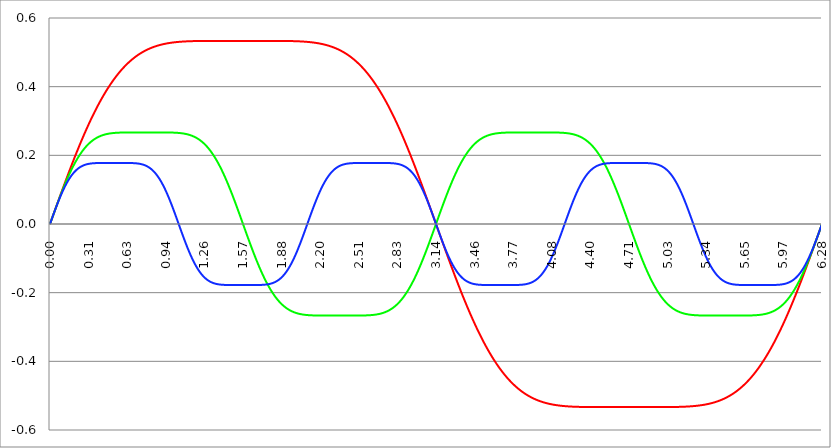
| Category | Series 1 | Series 0 | Series 2 |
|---|---|---|---|
| 0.0 | 0 | 0 | 0 |
| 0.00314159265358979 | 0.003 | 0.003 | 0.003 |
| 0.00628318530717958 | 0.006 | 0.006 | 0.006 |
| 0.00942477796076938 | 0.009 | 0.009 | 0.009 |
| 0.0125663706143592 | 0.013 | 0.013 | 0.013 |
| 0.015707963267949 | 0.016 | 0.016 | 0.016 |
| 0.0188495559215388 | 0.019 | 0.019 | 0.019 |
| 0.0219911485751285 | 0.022 | 0.022 | 0.022 |
| 0.0251327412287183 | 0.025 | 0.025 | 0.025 |
| 0.0282743338823081 | 0.028 | 0.028 | 0.028 |
| 0.0314159265358979 | 0.031 | 0.031 | 0.031 |
| 0.0345575191894877 | 0.035 | 0.034 | 0.034 |
| 0.0376991118430775 | 0.038 | 0.038 | 0.037 |
| 0.0408407044966673 | 0.041 | 0.041 | 0.04 |
| 0.0439822971502571 | 0.044 | 0.044 | 0.043 |
| 0.0471238898038469 | 0.047 | 0.047 | 0.046 |
| 0.0502654824574367 | 0.05 | 0.05 | 0.049 |
| 0.0534070751110265 | 0.053 | 0.053 | 0.052 |
| 0.0565486677646163 | 0.056 | 0.056 | 0.055 |
| 0.059690260418206 | 0.06 | 0.059 | 0.058 |
| 0.0628318530717958 | 0.063 | 0.062 | 0.061 |
| 0.0659734457253856 | 0.066 | 0.065 | 0.064 |
| 0.0691150383789754 | 0.069 | 0.068 | 0.067 |
| 0.0722566310325652 | 0.072 | 0.071 | 0.07 |
| 0.075398223686155 | 0.075 | 0.074 | 0.072 |
| 0.0785398163397448 | 0.078 | 0.077 | 0.075 |
| 0.0816814089933346 | 0.081 | 0.08 | 0.078 |
| 0.0848230016469244 | 0.084 | 0.083 | 0.08 |
| 0.0879645943005142 | 0.087 | 0.086 | 0.083 |
| 0.091106186954104 | 0.09 | 0.089 | 0.086 |
| 0.0942477796076937 | 0.094 | 0.092 | 0.088 |
| 0.0973893722612835 | 0.097 | 0.094 | 0.091 |
| 0.100530964914873 | 0.1 | 0.097 | 0.093 |
| 0.103672557568463 | 0.103 | 0.1 | 0.096 |
| 0.106814150222053 | 0.106 | 0.103 | 0.098 |
| 0.109955742875643 | 0.109 | 0.106 | 0.101 |
| 0.113097335529233 | 0.112 | 0.108 | 0.103 |
| 0.116238928182822 | 0.115 | 0.111 | 0.105 |
| 0.119380520836412 | 0.118 | 0.114 | 0.108 |
| 0.122522113490002 | 0.121 | 0.117 | 0.11 |
| 0.125663706143592 | 0.124 | 0.119 | 0.112 |
| 0.128805298797181 | 0.127 | 0.122 | 0.114 |
| 0.131946891450771 | 0.13 | 0.125 | 0.116 |
| 0.135088484104361 | 0.133 | 0.127 | 0.118 |
| 0.138230076757951 | 0.136 | 0.13 | 0.12 |
| 0.141371669411541 | 0.139 | 0.132 | 0.122 |
| 0.14451326206513 | 0.142 | 0.135 | 0.124 |
| 0.14765485471872 | 0.145 | 0.138 | 0.126 |
| 0.15079644737231 | 0.148 | 0.14 | 0.128 |
| 0.1539380400259 | 0.151 | 0.142 | 0.13 |
| 0.15707963267949 | 0.154 | 0.145 | 0.132 |
| 0.160221225333079 | 0.157 | 0.147 | 0.134 |
| 0.163362817986669 | 0.16 | 0.15 | 0.135 |
| 0.166504410640259 | 0.163 | 0.152 | 0.137 |
| 0.169646003293849 | 0.166 | 0.155 | 0.139 |
| 0.172787595947439 | 0.169 | 0.157 | 0.14 |
| 0.175929188601028 | 0.171 | 0.159 | 0.142 |
| 0.179070781254618 | 0.174 | 0.161 | 0.143 |
| 0.182212373908208 | 0.177 | 0.164 | 0.145 |
| 0.185353966561798 | 0.18 | 0.166 | 0.146 |
| 0.188495559215388 | 0.183 | 0.168 | 0.147 |
| 0.191637151868977 | 0.186 | 0.17 | 0.149 |
| 0.194778744522567 | 0.189 | 0.172 | 0.15 |
| 0.197920337176157 | 0.192 | 0.175 | 0.151 |
| 0.201061929829747 | 0.194 | 0.177 | 0.152 |
| 0.204203522483336 | 0.197 | 0.179 | 0.154 |
| 0.207345115136926 | 0.2 | 0.181 | 0.155 |
| 0.210486707790516 | 0.203 | 0.183 | 0.156 |
| 0.213628300444106 | 0.206 | 0.185 | 0.157 |
| 0.216769893097696 | 0.209 | 0.187 | 0.158 |
| 0.219911485751285 | 0.211 | 0.189 | 0.159 |
| 0.223053078404875 | 0.214 | 0.19 | 0.16 |
| 0.226194671058465 | 0.217 | 0.192 | 0.161 |
| 0.229336263712055 | 0.22 | 0.194 | 0.162 |
| 0.232477856365645 | 0.222 | 0.196 | 0.162 |
| 0.235619449019234 | 0.225 | 0.198 | 0.163 |
| 0.238761041672824 | 0.228 | 0.199 | 0.164 |
| 0.241902634326414 | 0.231 | 0.201 | 0.165 |
| 0.245044226980004 | 0.233 | 0.203 | 0.166 |
| 0.248185819633594 | 0.236 | 0.205 | 0.166 |
| 0.251327412287183 | 0.239 | 0.206 | 0.167 |
| 0.254469004940773 | 0.241 | 0.208 | 0.168 |
| 0.257610597594363 | 0.244 | 0.209 | 0.168 |
| 0.260752190247953 | 0.247 | 0.211 | 0.169 |
| 0.263893782901543 | 0.249 | 0.212 | 0.169 |
| 0.267035375555132 | 0.252 | 0.214 | 0.17 |
| 0.270176968208722 | 0.254 | 0.215 | 0.17 |
| 0.273318560862312 | 0.257 | 0.217 | 0.171 |
| 0.276460153515902 | 0.26 | 0.218 | 0.171 |
| 0.279601746169492 | 0.262 | 0.22 | 0.172 |
| 0.282743338823082 | 0.265 | 0.221 | 0.172 |
| 0.285884931476671 | 0.267 | 0.222 | 0.172 |
| 0.289026524130261 | 0.27 | 0.224 | 0.173 |
| 0.292168116783851 | 0.272 | 0.225 | 0.173 |
| 0.295309709437441 | 0.275 | 0.226 | 0.174 |
| 0.298451302091031 | 0.278 | 0.227 | 0.174 |
| 0.30159289474462 | 0.28 | 0.229 | 0.174 |
| 0.30473448739821 | 0.283 | 0.23 | 0.174 |
| 0.3078760800518 | 0.285 | 0.231 | 0.175 |
| 0.31101767270539 | 0.287 | 0.232 | 0.175 |
| 0.31415926535898 | 0.29 | 0.233 | 0.175 |
| 0.31730085801257 | 0.292 | 0.234 | 0.175 |
| 0.320442450666159 | 0.295 | 0.235 | 0.176 |
| 0.323584043319749 | 0.297 | 0.236 | 0.176 |
| 0.326725635973339 | 0.3 | 0.237 | 0.176 |
| 0.329867228626929 | 0.302 | 0.238 | 0.176 |
| 0.333008821280519 | 0.304 | 0.239 | 0.176 |
| 0.336150413934108 | 0.307 | 0.24 | 0.176 |
| 0.339292006587698 | 0.309 | 0.241 | 0.176 |
| 0.342433599241288 | 0.311 | 0.242 | 0.177 |
| 0.345575191894878 | 0.314 | 0.243 | 0.177 |
| 0.348716784548468 | 0.316 | 0.244 | 0.177 |
| 0.351858377202058 | 0.318 | 0.245 | 0.177 |
| 0.354999969855647 | 0.321 | 0.245 | 0.177 |
| 0.358141562509237 | 0.323 | 0.246 | 0.177 |
| 0.361283155162827 | 0.325 | 0.247 | 0.177 |
| 0.364424747816417 | 0.327 | 0.248 | 0.177 |
| 0.367566340470007 | 0.33 | 0.248 | 0.177 |
| 0.370707933123597 | 0.332 | 0.249 | 0.177 |
| 0.373849525777186 | 0.334 | 0.25 | 0.177 |
| 0.376991118430776 | 0.336 | 0.25 | 0.177 |
| 0.380132711084366 | 0.338 | 0.251 | 0.177 |
| 0.383274303737956 | 0.341 | 0.252 | 0.178 |
| 0.386415896391546 | 0.343 | 0.252 | 0.178 |
| 0.389557489045135 | 0.345 | 0.253 | 0.178 |
| 0.392699081698725 | 0.347 | 0.253 | 0.178 |
| 0.395840674352315 | 0.349 | 0.254 | 0.178 |
| 0.398982267005905 | 0.351 | 0.254 | 0.178 |
| 0.402123859659495 | 0.353 | 0.255 | 0.178 |
| 0.405265452313085 | 0.355 | 0.255 | 0.178 |
| 0.408407044966674 | 0.357 | 0.256 | 0.178 |
| 0.411548637620264 | 0.359 | 0.256 | 0.178 |
| 0.414690230273854 | 0.361 | 0.257 | 0.178 |
| 0.417831822927444 | 0.363 | 0.257 | 0.178 |
| 0.420973415581034 | 0.365 | 0.258 | 0.178 |
| 0.424115008234623 | 0.367 | 0.258 | 0.178 |
| 0.427256600888213 | 0.369 | 0.259 | 0.178 |
| 0.430398193541803 | 0.371 | 0.259 | 0.178 |
| 0.433539786195393 | 0.373 | 0.259 | 0.178 |
| 0.436681378848983 | 0.375 | 0.26 | 0.178 |
| 0.439822971502573 | 0.377 | 0.26 | 0.178 |
| 0.442964564156162 | 0.379 | 0.26 | 0.178 |
| 0.446106156809752 | 0.381 | 0.261 | 0.178 |
| 0.449247749463342 | 0.383 | 0.261 | 0.178 |
| 0.452389342116932 | 0.385 | 0.261 | 0.178 |
| 0.455530934770522 | 0.386 | 0.261 | 0.178 |
| 0.458672527424111 | 0.388 | 0.262 | 0.178 |
| 0.461814120077701 | 0.39 | 0.262 | 0.178 |
| 0.464955712731291 | 0.392 | 0.262 | 0.178 |
| 0.468097305384881 | 0.394 | 0.262 | 0.178 |
| 0.471238898038471 | 0.395 | 0.263 | 0.178 |
| 0.474380490692061 | 0.397 | 0.263 | 0.178 |
| 0.47752208334565 | 0.399 | 0.263 | 0.178 |
| 0.48066367599924 | 0.401 | 0.263 | 0.178 |
| 0.48380526865283 | 0.402 | 0.263 | 0.178 |
| 0.48694686130642 | 0.404 | 0.264 | 0.178 |
| 0.49008845396001 | 0.406 | 0.264 | 0.178 |
| 0.493230046613599 | 0.407 | 0.264 | 0.178 |
| 0.496371639267189 | 0.409 | 0.264 | 0.178 |
| 0.499513231920779 | 0.411 | 0.264 | 0.178 |
| 0.502654824574369 | 0.412 | 0.264 | 0.178 |
| 0.505796417227959 | 0.414 | 0.265 | 0.178 |
| 0.508938009881549 | 0.416 | 0.265 | 0.178 |
| 0.512079602535138 | 0.417 | 0.265 | 0.178 |
| 0.515221195188728 | 0.419 | 0.265 | 0.178 |
| 0.518362787842318 | 0.42 | 0.265 | 0.178 |
| 0.521504380495908 | 0.422 | 0.265 | 0.178 |
| 0.524645973149498 | 0.423 | 0.265 | 0.178 |
| 0.527787565803087 | 0.425 | 0.265 | 0.178 |
| 0.530929158456677 | 0.426 | 0.265 | 0.178 |
| 0.534070751110267 | 0.428 | 0.266 | 0.178 |
| 0.537212343763857 | 0.429 | 0.266 | 0.178 |
| 0.540353936417447 | 0.431 | 0.266 | 0.178 |
| 0.543495529071037 | 0.432 | 0.266 | 0.178 |
| 0.546637121724626 | 0.434 | 0.266 | 0.178 |
| 0.549778714378216 | 0.435 | 0.266 | 0.178 |
| 0.552920307031806 | 0.437 | 0.266 | 0.178 |
| 0.556061899685396 | 0.438 | 0.266 | 0.178 |
| 0.559203492338986 | 0.439 | 0.266 | 0.178 |
| 0.562345084992576 | 0.441 | 0.266 | 0.178 |
| 0.565486677646165 | 0.442 | 0.266 | 0.178 |
| 0.568628270299755 | 0.443 | 0.266 | 0.178 |
| 0.571769862953345 | 0.445 | 0.266 | 0.178 |
| 0.574911455606935 | 0.446 | 0.266 | 0.178 |
| 0.578053048260525 | 0.447 | 0.266 | 0.178 |
| 0.581194640914114 | 0.449 | 0.266 | 0.178 |
| 0.584336233567704 | 0.45 | 0.266 | 0.178 |
| 0.587477826221294 | 0.451 | 0.266 | 0.178 |
| 0.590619418874884 | 0.452 | 0.266 | 0.178 |
| 0.593761011528474 | 0.454 | 0.266 | 0.178 |
| 0.596902604182064 | 0.455 | 0.266 | 0.178 |
| 0.600044196835653 | 0.456 | 0.266 | 0.178 |
| 0.603185789489243 | 0.457 | 0.266 | 0.178 |
| 0.606327382142833 | 0.459 | 0.267 | 0.178 |
| 0.609468974796423 | 0.46 | 0.267 | 0.178 |
| 0.612610567450013 | 0.461 | 0.267 | 0.178 |
| 0.615752160103602 | 0.462 | 0.267 | 0.178 |
| 0.618893752757192 | 0.463 | 0.267 | 0.178 |
| 0.622035345410782 | 0.464 | 0.267 | 0.178 |
| 0.625176938064372 | 0.465 | 0.267 | 0.178 |
| 0.628318530717962 | 0.466 | 0.267 | 0.178 |
| 0.631460123371551 | 0.468 | 0.267 | 0.178 |
| 0.634601716025141 | 0.469 | 0.267 | 0.178 |
| 0.637743308678731 | 0.47 | 0.267 | 0.178 |
| 0.640884901332321 | 0.471 | 0.267 | 0.178 |
| 0.644026493985911 | 0.472 | 0.267 | 0.178 |
| 0.647168086639501 | 0.473 | 0.267 | 0.178 |
| 0.65030967929309 | 0.474 | 0.267 | 0.178 |
| 0.65345127194668 | 0.475 | 0.267 | 0.178 |
| 0.65659286460027 | 0.476 | 0.267 | 0.178 |
| 0.65973445725386 | 0.477 | 0.267 | 0.178 |
| 0.66287604990745 | 0.478 | 0.267 | 0.178 |
| 0.666017642561039 | 0.479 | 0.267 | 0.177 |
| 0.669159235214629 | 0.48 | 0.267 | 0.177 |
| 0.672300827868219 | 0.48 | 0.267 | 0.177 |
| 0.675442420521809 | 0.481 | 0.267 | 0.177 |
| 0.678584013175399 | 0.482 | 0.267 | 0.177 |
| 0.681725605828989 | 0.483 | 0.267 | 0.177 |
| 0.684867198482578 | 0.484 | 0.267 | 0.177 |
| 0.688008791136168 | 0.485 | 0.267 | 0.177 |
| 0.691150383789758 | 0.486 | 0.267 | 0.177 |
| 0.694291976443348 | 0.487 | 0.267 | 0.177 |
| 0.697433569096938 | 0.487 | 0.267 | 0.177 |
| 0.700575161750528 | 0.488 | 0.267 | 0.177 |
| 0.703716754404117 | 0.489 | 0.267 | 0.177 |
| 0.706858347057707 | 0.49 | 0.267 | 0.177 |
| 0.709999939711297 | 0.491 | 0.267 | 0.176 |
| 0.713141532364887 | 0.492 | 0.267 | 0.176 |
| 0.716283125018477 | 0.492 | 0.267 | 0.176 |
| 0.719424717672066 | 0.493 | 0.267 | 0.176 |
| 0.722566310325656 | 0.494 | 0.267 | 0.176 |
| 0.725707902979246 | 0.495 | 0.267 | 0.176 |
| 0.728849495632836 | 0.495 | 0.267 | 0.175 |
| 0.731991088286426 | 0.496 | 0.267 | 0.175 |
| 0.735132680940016 | 0.497 | 0.267 | 0.175 |
| 0.738274273593605 | 0.497 | 0.267 | 0.175 |
| 0.741415866247195 | 0.498 | 0.267 | 0.174 |
| 0.744557458900785 | 0.499 | 0.267 | 0.174 |
| 0.747699051554375 | 0.499 | 0.267 | 0.174 |
| 0.750840644207965 | 0.5 | 0.267 | 0.174 |
| 0.753982236861554 | 0.501 | 0.267 | 0.173 |
| 0.757123829515144 | 0.501 | 0.267 | 0.173 |
| 0.760265422168734 | 0.502 | 0.267 | 0.173 |
| 0.763407014822324 | 0.503 | 0.267 | 0.172 |
| 0.766548607475914 | 0.503 | 0.267 | 0.172 |
| 0.769690200129504 | 0.504 | 0.267 | 0.171 |
| 0.772831792783093 | 0.504 | 0.267 | 0.171 |
| 0.775973385436683 | 0.505 | 0.267 | 0.17 |
| 0.779114978090273 | 0.506 | 0.267 | 0.17 |
| 0.782256570743863 | 0.506 | 0.267 | 0.169 |
| 0.785398163397453 | 0.507 | 0.267 | 0.169 |
| 0.788539756051042 | 0.507 | 0.267 | 0.168 |
| 0.791681348704632 | 0.508 | 0.267 | 0.168 |
| 0.794822941358222 | 0.508 | 0.267 | 0.167 |
| 0.797964534011812 | 0.509 | 0.267 | 0.166 |
| 0.801106126665402 | 0.509 | 0.267 | 0.166 |
| 0.804247719318992 | 0.51 | 0.267 | 0.165 |
| 0.807389311972581 | 0.51 | 0.267 | 0.164 |
| 0.810530904626171 | 0.511 | 0.267 | 0.164 |
| 0.813672497279761 | 0.511 | 0.267 | 0.163 |
| 0.816814089933351 | 0.512 | 0.267 | 0.162 |
| 0.819955682586941 | 0.512 | 0.267 | 0.161 |
| 0.823097275240531 | 0.513 | 0.267 | 0.16 |
| 0.82623886789412 | 0.513 | 0.267 | 0.159 |
| 0.82938046054771 | 0.514 | 0.267 | 0.158 |
| 0.8325220532013 | 0.514 | 0.267 | 0.157 |
| 0.83566364585489 | 0.515 | 0.267 | 0.156 |
| 0.83880523850848 | 0.515 | 0.267 | 0.155 |
| 0.841946831162069 | 0.515 | 0.267 | 0.154 |
| 0.845088423815659 | 0.516 | 0.267 | 0.153 |
| 0.848230016469249 | 0.516 | 0.267 | 0.152 |
| 0.851371609122839 | 0.517 | 0.267 | 0.15 |
| 0.854513201776429 | 0.517 | 0.267 | 0.149 |
| 0.857654794430019 | 0.517 | 0.267 | 0.148 |
| 0.860796387083608 | 0.518 | 0.267 | 0.146 |
| 0.863937979737198 | 0.518 | 0.267 | 0.145 |
| 0.867079572390788 | 0.518 | 0.267 | 0.144 |
| 0.870221165044378 | 0.519 | 0.267 | 0.142 |
| 0.873362757697968 | 0.519 | 0.267 | 0.141 |
| 0.876504350351557 | 0.52 | 0.267 | 0.139 |
| 0.879645943005147 | 0.52 | 0.267 | 0.137 |
| 0.882787535658737 | 0.52 | 0.267 | 0.136 |
| 0.885929128312327 | 0.521 | 0.267 | 0.134 |
| 0.889070720965917 | 0.521 | 0.267 | 0.132 |
| 0.892212313619507 | 0.521 | 0.267 | 0.131 |
| 0.895353906273096 | 0.521 | 0.267 | 0.129 |
| 0.898495498926686 | 0.522 | 0.267 | 0.127 |
| 0.901637091580276 | 0.522 | 0.267 | 0.125 |
| 0.904778684233866 | 0.522 | 0.267 | 0.123 |
| 0.907920276887456 | 0.523 | 0.267 | 0.121 |
| 0.911061869541045 | 0.523 | 0.267 | 0.119 |
| 0.914203462194635 | 0.523 | 0.267 | 0.117 |
| 0.917345054848225 | 0.523 | 0.267 | 0.115 |
| 0.920486647501815 | 0.524 | 0.267 | 0.113 |
| 0.923628240155405 | 0.524 | 0.267 | 0.111 |
| 0.926769832808995 | 0.524 | 0.267 | 0.108 |
| 0.929911425462584 | 0.524 | 0.267 | 0.106 |
| 0.933053018116174 | 0.525 | 0.267 | 0.104 |
| 0.936194610769764 | 0.525 | 0.267 | 0.101 |
| 0.939336203423354 | 0.525 | 0.267 | 0.099 |
| 0.942477796076944 | 0.525 | 0.267 | 0.097 |
| 0.945619388730533 | 0.526 | 0.267 | 0.094 |
| 0.948760981384123 | 0.526 | 0.267 | 0.092 |
| 0.951902574037713 | 0.526 | 0.267 | 0.089 |
| 0.955044166691303 | 0.526 | 0.267 | 0.087 |
| 0.958185759344893 | 0.526 | 0.267 | 0.084 |
| 0.961327351998483 | 0.527 | 0.267 | 0.081 |
| 0.964468944652072 | 0.527 | 0.267 | 0.079 |
| 0.967610537305662 | 0.527 | 0.266 | 0.076 |
| 0.970752129959252 | 0.527 | 0.266 | 0.073 |
| 0.973893722612842 | 0.527 | 0.266 | 0.07 |
| 0.977035315266432 | 0.527 | 0.266 | 0.068 |
| 0.980176907920022 | 0.528 | 0.266 | 0.065 |
| 0.983318500573611 | 0.528 | 0.266 | 0.062 |
| 0.986460093227201 | 0.528 | 0.266 | 0.059 |
| 0.989601685880791 | 0.528 | 0.266 | 0.056 |
| 0.992743278534381 | 0.528 | 0.266 | 0.053 |
| 0.995884871187971 | 0.528 | 0.266 | 0.05 |
| 0.99902646384156 | 0.529 | 0.266 | 0.047 |
| 1.00216805649515 | 0.529 | 0.266 | 0.044 |
| 1.00530964914874 | 0.529 | 0.266 | 0.041 |
| 1.00845124180233 | 0.529 | 0.266 | 0.038 |
| 1.01159283445592 | 0.529 | 0.266 | 0.035 |
| 1.01473442710951 | 0.529 | 0.266 | 0.032 |
| 1.017876019763099 | 0.529 | 0.266 | 0.029 |
| 1.021017612416689 | 0.53 | 0.266 | 0.026 |
| 1.02415920507028 | 0.53 | 0.266 | 0.023 |
| 1.027300797723869 | 0.53 | 0.266 | 0.02 |
| 1.030442390377459 | 0.53 | 0.266 | 0.017 |
| 1.033583983031048 | 0.53 | 0.266 | 0.014 |
| 1.036725575684638 | 0.53 | 0.266 | 0.01 |
| 1.039867168338228 | 0.53 | 0.265 | 0.007 |
| 1.043008760991818 | 0.53 | 0.265 | 0.004 |
| 1.046150353645408 | 0.53 | 0.265 | 0.001 |
| 1.049291946298998 | 0.531 | 0.265 | -0.002 |
| 1.052433538952587 | 0.531 | 0.265 | -0.005 |
| 1.055575131606177 | 0.531 | 0.265 | -0.008 |
| 1.058716724259767 | 0.531 | 0.265 | -0.012 |
| 1.061858316913357 | 0.531 | 0.265 | -0.015 |
| 1.064999909566947 | 0.531 | 0.265 | -0.018 |
| 1.068141502220536 | 0.531 | 0.264 | -0.021 |
| 1.071283094874126 | 0.531 | 0.264 | -0.024 |
| 1.074424687527716 | 0.531 | 0.264 | -0.027 |
| 1.077566280181306 | 0.531 | 0.264 | -0.03 |
| 1.080707872834896 | 0.531 | 0.264 | -0.033 |
| 1.083849465488486 | 0.531 | 0.264 | -0.036 |
| 1.086991058142075 | 0.531 | 0.263 | -0.039 |
| 1.090132650795665 | 0.532 | 0.263 | -0.042 |
| 1.093274243449255 | 0.532 | 0.263 | -0.045 |
| 1.096415836102845 | 0.532 | 0.263 | -0.048 |
| 1.099557428756435 | 0.532 | 0.263 | -0.051 |
| 1.102699021410025 | 0.532 | 0.262 | -0.054 |
| 1.105840614063614 | 0.532 | 0.262 | -0.057 |
| 1.108982206717204 | 0.532 | 0.262 | -0.06 |
| 1.112123799370794 | 0.532 | 0.262 | -0.063 |
| 1.115265392024384 | 0.532 | 0.261 | -0.066 |
| 1.118406984677974 | 0.532 | 0.261 | -0.069 |
| 1.121548577331563 | 0.532 | 0.261 | -0.071 |
| 1.124690169985153 | 0.532 | 0.261 | -0.074 |
| 1.127831762638743 | 0.532 | 0.26 | -0.077 |
| 1.130973355292333 | 0.532 | 0.26 | -0.08 |
| 1.134114947945923 | 0.532 | 0.26 | -0.082 |
| 1.137256540599513 | 0.532 | 0.259 | -0.085 |
| 1.140398133253102 | 0.532 | 0.259 | -0.087 |
| 1.143539725906692 | 0.532 | 0.259 | -0.09 |
| 1.146681318560282 | 0.532 | 0.258 | -0.093 |
| 1.149822911213872 | 0.533 | 0.258 | -0.095 |
| 1.152964503867462 | 0.533 | 0.257 | -0.097 |
| 1.156106096521051 | 0.533 | 0.257 | -0.1 |
| 1.159247689174641 | 0.533 | 0.256 | -0.102 |
| 1.162389281828231 | 0.533 | 0.256 | -0.105 |
| 1.165530874481821 | 0.533 | 0.255 | -0.107 |
| 1.168672467135411 | 0.533 | 0.255 | -0.109 |
| 1.171814059789001 | 0.533 | 0.254 | -0.111 |
| 1.17495565244259 | 0.533 | 0.254 | -0.114 |
| 1.17809724509618 | 0.533 | 0.253 | -0.116 |
| 1.18123883774977 | 0.533 | 0.253 | -0.118 |
| 1.18438043040336 | 0.533 | 0.252 | -0.12 |
| 1.18752202305695 | 0.533 | 0.252 | -0.122 |
| 1.190663615710539 | 0.533 | 0.251 | -0.124 |
| 1.193805208364129 | 0.533 | 0.25 | -0.126 |
| 1.19694680101772 | 0.533 | 0.25 | -0.128 |
| 1.200088393671309 | 0.533 | 0.249 | -0.129 |
| 1.203229986324899 | 0.533 | 0.248 | -0.131 |
| 1.206371578978489 | 0.533 | 0.248 | -0.133 |
| 1.209513171632078 | 0.533 | 0.247 | -0.135 |
| 1.212654764285668 | 0.533 | 0.246 | -0.136 |
| 1.215796356939258 | 0.533 | 0.245 | -0.138 |
| 1.218937949592848 | 0.533 | 0.245 | -0.14 |
| 1.222079542246438 | 0.533 | 0.244 | -0.141 |
| 1.225221134900027 | 0.533 | 0.243 | -0.143 |
| 1.228362727553617 | 0.533 | 0.242 | -0.144 |
| 1.231504320207207 | 0.533 | 0.241 | -0.146 |
| 1.234645912860797 | 0.533 | 0.24 | -0.147 |
| 1.237787505514387 | 0.533 | 0.239 | -0.148 |
| 1.240929098167977 | 0.533 | 0.238 | -0.15 |
| 1.244070690821566 | 0.533 | 0.237 | -0.151 |
| 1.247212283475156 | 0.533 | 0.236 | -0.152 |
| 1.250353876128746 | 0.533 | 0.235 | -0.153 |
| 1.253495468782336 | 0.533 | 0.234 | -0.154 |
| 1.256637061435926 | 0.533 | 0.233 | -0.155 |
| 1.259778654089515 | 0.533 | 0.232 | -0.157 |
| 1.262920246743105 | 0.533 | 0.231 | -0.158 |
| 1.266061839396695 | 0.533 | 0.23 | -0.159 |
| 1.269203432050285 | 0.533 | 0.229 | -0.16 |
| 1.272345024703875 | 0.533 | 0.227 | -0.16 |
| 1.275486617357465 | 0.533 | 0.226 | -0.161 |
| 1.278628210011054 | 0.533 | 0.225 | -0.162 |
| 1.281769802664644 | 0.533 | 0.224 | -0.163 |
| 1.284911395318234 | 0.533 | 0.222 | -0.164 |
| 1.288052987971824 | 0.533 | 0.221 | -0.165 |
| 1.291194580625414 | 0.533 | 0.22 | -0.165 |
| 1.294336173279003 | 0.533 | 0.218 | -0.166 |
| 1.297477765932593 | 0.533 | 0.217 | -0.167 |
| 1.300619358586183 | 0.533 | 0.215 | -0.167 |
| 1.303760951239773 | 0.533 | 0.214 | -0.168 |
| 1.306902543893363 | 0.533 | 0.212 | -0.169 |
| 1.310044136546953 | 0.533 | 0.211 | -0.169 |
| 1.313185729200542 | 0.533 | 0.209 | -0.17 |
| 1.316327321854132 | 0.533 | 0.208 | -0.17 |
| 1.319468914507722 | 0.533 | 0.206 | -0.171 |
| 1.322610507161312 | 0.533 | 0.205 | -0.171 |
| 1.325752099814902 | 0.533 | 0.203 | -0.172 |
| 1.328893692468491 | 0.533 | 0.201 | -0.172 |
| 1.332035285122081 | 0.533 | 0.199 | -0.172 |
| 1.335176877775671 | 0.533 | 0.198 | -0.173 |
| 1.338318470429261 | 0.533 | 0.196 | -0.173 |
| 1.341460063082851 | 0.533 | 0.194 | -0.173 |
| 1.344601655736441 | 0.533 | 0.192 | -0.174 |
| 1.34774324839003 | 0.533 | 0.19 | -0.174 |
| 1.35088484104362 | 0.533 | 0.189 | -0.174 |
| 1.35402643369721 | 0.533 | 0.187 | -0.175 |
| 1.3571680263508 | 0.533 | 0.185 | -0.175 |
| 1.36030961900439 | 0.533 | 0.183 | -0.175 |
| 1.363451211657979 | 0.533 | 0.181 | -0.175 |
| 1.36659280431157 | 0.533 | 0.179 | -0.175 |
| 1.369734396965159 | 0.533 | 0.177 | -0.176 |
| 1.372875989618749 | 0.533 | 0.175 | -0.176 |
| 1.376017582272339 | 0.533 | 0.172 | -0.176 |
| 1.379159174925929 | 0.533 | 0.17 | -0.176 |
| 1.382300767579518 | 0.533 | 0.168 | -0.176 |
| 1.385442360233108 | 0.533 | 0.166 | -0.176 |
| 1.388583952886698 | 0.533 | 0.164 | -0.177 |
| 1.391725545540288 | 0.533 | 0.161 | -0.177 |
| 1.394867138193878 | 0.533 | 0.159 | -0.177 |
| 1.398008730847468 | 0.533 | 0.157 | -0.177 |
| 1.401150323501057 | 0.533 | 0.155 | -0.177 |
| 1.404291916154647 | 0.533 | 0.152 | -0.177 |
| 1.407433508808237 | 0.533 | 0.15 | -0.177 |
| 1.410575101461827 | 0.533 | 0.147 | -0.177 |
| 1.413716694115417 | 0.533 | 0.145 | -0.177 |
| 1.416858286769006 | 0.533 | 0.142 | -0.177 |
| 1.419999879422596 | 0.533 | 0.14 | -0.177 |
| 1.423141472076186 | 0.533 | 0.138 | -0.177 |
| 1.426283064729776 | 0.533 | 0.135 | -0.177 |
| 1.429424657383366 | 0.533 | 0.132 | -0.177 |
| 1.432566250036956 | 0.533 | 0.13 | -0.178 |
| 1.435707842690545 | 0.533 | 0.127 | -0.178 |
| 1.438849435344135 | 0.533 | 0.125 | -0.178 |
| 1.441991027997725 | 0.533 | 0.122 | -0.178 |
| 1.445132620651315 | 0.533 | 0.119 | -0.178 |
| 1.448274213304905 | 0.533 | 0.117 | -0.178 |
| 1.451415805958494 | 0.533 | 0.114 | -0.178 |
| 1.454557398612084 | 0.533 | 0.111 | -0.178 |
| 1.457698991265674 | 0.533 | 0.108 | -0.178 |
| 1.460840583919264 | 0.533 | 0.106 | -0.178 |
| 1.463982176572854 | 0.533 | 0.103 | -0.178 |
| 1.467123769226444 | 0.533 | 0.1 | -0.178 |
| 1.470265361880033 | 0.533 | 0.097 | -0.178 |
| 1.473406954533623 | 0.533 | 0.094 | -0.178 |
| 1.476548547187213 | 0.533 | 0.092 | -0.178 |
| 1.479690139840803 | 0.533 | 0.089 | -0.178 |
| 1.482831732494393 | 0.533 | 0.086 | -0.178 |
| 1.485973325147982 | 0.533 | 0.083 | -0.178 |
| 1.489114917801572 | 0.533 | 0.08 | -0.178 |
| 1.492256510455162 | 0.533 | 0.077 | -0.178 |
| 1.495398103108752 | 0.533 | 0.074 | -0.178 |
| 1.498539695762342 | 0.533 | 0.071 | -0.178 |
| 1.501681288415932 | 0.533 | 0.068 | -0.178 |
| 1.504822881069521 | 0.533 | 0.065 | -0.178 |
| 1.507964473723111 | 0.533 | 0.062 | -0.178 |
| 1.511106066376701 | 0.533 | 0.059 | -0.178 |
| 1.514247659030291 | 0.533 | 0.056 | -0.178 |
| 1.517389251683881 | 0.533 | 0.053 | -0.178 |
| 1.520530844337471 | 0.533 | 0.05 | -0.178 |
| 1.52367243699106 | 0.533 | 0.047 | -0.178 |
| 1.52681402964465 | 0.533 | 0.044 | -0.178 |
| 1.52995562229824 | 0.533 | 0.041 | -0.178 |
| 1.53309721495183 | 0.533 | 0.038 | -0.178 |
| 1.53623880760542 | 0.533 | 0.034 | -0.178 |
| 1.539380400259009 | 0.533 | 0.031 | -0.178 |
| 1.542521992912599 | 0.533 | 0.028 | -0.178 |
| 1.545663585566189 | 0.533 | 0.025 | -0.178 |
| 1.548805178219779 | 0.533 | 0.022 | -0.178 |
| 1.551946770873369 | 0.533 | 0.019 | -0.178 |
| 1.555088363526959 | 0.533 | 0.016 | -0.178 |
| 1.558229956180548 | 0.533 | 0.013 | -0.178 |
| 1.561371548834138 | 0.533 | 0.009 | -0.178 |
| 1.564513141487728 | 0.533 | 0.006 | -0.178 |
| 1.567654734141318 | 0.533 | 0.003 | -0.178 |
| 1.570796326794908 | 0.533 | 0 | -0.178 |
| 1.573937919448497 | 0.533 | -0.003 | -0.178 |
| 1.577079512102087 | 0.533 | -0.006 | -0.178 |
| 1.580221104755677 | 0.533 | -0.009 | -0.178 |
| 1.583362697409267 | 0.533 | -0.013 | -0.178 |
| 1.586504290062857 | 0.533 | -0.016 | -0.178 |
| 1.589645882716447 | 0.533 | -0.019 | -0.178 |
| 1.592787475370036 | 0.533 | -0.022 | -0.178 |
| 1.595929068023626 | 0.533 | -0.025 | -0.178 |
| 1.599070660677216 | 0.533 | -0.028 | -0.178 |
| 1.602212253330806 | 0.533 | -0.031 | -0.178 |
| 1.605353845984396 | 0.533 | -0.034 | -0.178 |
| 1.608495438637985 | 0.533 | -0.038 | -0.178 |
| 1.611637031291575 | 0.533 | -0.041 | -0.178 |
| 1.614778623945165 | 0.533 | -0.044 | -0.178 |
| 1.617920216598755 | 0.533 | -0.047 | -0.178 |
| 1.621061809252345 | 0.533 | -0.05 | -0.178 |
| 1.624203401905935 | 0.533 | -0.053 | -0.178 |
| 1.627344994559524 | 0.533 | -0.056 | -0.178 |
| 1.630486587213114 | 0.533 | -0.059 | -0.178 |
| 1.633628179866704 | 0.533 | -0.062 | -0.178 |
| 1.636769772520294 | 0.533 | -0.065 | -0.178 |
| 1.639911365173884 | 0.533 | -0.068 | -0.178 |
| 1.643052957827473 | 0.533 | -0.071 | -0.178 |
| 1.646194550481063 | 0.533 | -0.074 | -0.178 |
| 1.649336143134653 | 0.533 | -0.077 | -0.178 |
| 1.652477735788243 | 0.533 | -0.08 | -0.178 |
| 1.655619328441833 | 0.533 | -0.083 | -0.178 |
| 1.658760921095423 | 0.533 | -0.086 | -0.178 |
| 1.661902513749012 | 0.533 | -0.089 | -0.178 |
| 1.665044106402602 | 0.533 | -0.092 | -0.178 |
| 1.668185699056192 | 0.533 | -0.094 | -0.178 |
| 1.671327291709782 | 0.533 | -0.097 | -0.178 |
| 1.674468884363372 | 0.533 | -0.1 | -0.178 |
| 1.677610477016961 | 0.533 | -0.103 | -0.178 |
| 1.680752069670551 | 0.533 | -0.106 | -0.178 |
| 1.683893662324141 | 0.533 | -0.108 | -0.178 |
| 1.687035254977731 | 0.533 | -0.111 | -0.178 |
| 1.690176847631321 | 0.533 | -0.114 | -0.178 |
| 1.693318440284911 | 0.533 | -0.117 | -0.178 |
| 1.6964600329385 | 0.533 | -0.119 | -0.178 |
| 1.69960162559209 | 0.533 | -0.122 | -0.178 |
| 1.70274321824568 | 0.533 | -0.125 | -0.178 |
| 1.70588481089927 | 0.533 | -0.127 | -0.178 |
| 1.70902640355286 | 0.533 | -0.13 | -0.178 |
| 1.712167996206449 | 0.533 | -0.132 | -0.177 |
| 1.715309588860039 | 0.533 | -0.135 | -0.177 |
| 1.71845118151363 | 0.533 | -0.138 | -0.177 |
| 1.721592774167219 | 0.533 | -0.14 | -0.177 |
| 1.724734366820809 | 0.533 | -0.142 | -0.177 |
| 1.727875959474399 | 0.533 | -0.145 | -0.177 |
| 1.731017552127988 | 0.533 | -0.147 | -0.177 |
| 1.734159144781578 | 0.533 | -0.15 | -0.177 |
| 1.737300737435168 | 0.533 | -0.152 | -0.177 |
| 1.740442330088758 | 0.533 | -0.155 | -0.177 |
| 1.743583922742348 | 0.533 | -0.157 | -0.177 |
| 1.746725515395937 | 0.533 | -0.159 | -0.177 |
| 1.749867108049527 | 0.533 | -0.161 | -0.177 |
| 1.753008700703117 | 0.533 | -0.164 | -0.177 |
| 1.756150293356707 | 0.533 | -0.166 | -0.176 |
| 1.759291886010297 | 0.533 | -0.168 | -0.176 |
| 1.762433478663887 | 0.533 | -0.17 | -0.176 |
| 1.765575071317476 | 0.533 | -0.172 | -0.176 |
| 1.768716663971066 | 0.533 | -0.175 | -0.176 |
| 1.771858256624656 | 0.533 | -0.177 | -0.176 |
| 1.774999849278246 | 0.533 | -0.179 | -0.175 |
| 1.778141441931836 | 0.533 | -0.181 | -0.175 |
| 1.781283034585426 | 0.533 | -0.183 | -0.175 |
| 1.784424627239015 | 0.533 | -0.185 | -0.175 |
| 1.787566219892605 | 0.533 | -0.187 | -0.175 |
| 1.790707812546195 | 0.533 | -0.189 | -0.174 |
| 1.793849405199785 | 0.533 | -0.19 | -0.174 |
| 1.796990997853375 | 0.533 | -0.192 | -0.174 |
| 1.800132590506964 | 0.533 | -0.194 | -0.173 |
| 1.803274183160554 | 0.533 | -0.196 | -0.173 |
| 1.806415775814144 | 0.533 | -0.198 | -0.173 |
| 1.809557368467734 | 0.533 | -0.199 | -0.172 |
| 1.812698961121324 | 0.533 | -0.201 | -0.172 |
| 1.815840553774914 | 0.533 | -0.203 | -0.172 |
| 1.818982146428503 | 0.533 | -0.205 | -0.171 |
| 1.822123739082093 | 0.533 | -0.206 | -0.171 |
| 1.825265331735683 | 0.533 | -0.208 | -0.17 |
| 1.828406924389273 | 0.533 | -0.209 | -0.17 |
| 1.831548517042863 | 0.533 | -0.211 | -0.169 |
| 1.834690109696452 | 0.533 | -0.212 | -0.169 |
| 1.837831702350042 | 0.533 | -0.214 | -0.168 |
| 1.840973295003632 | 0.533 | -0.215 | -0.167 |
| 1.844114887657222 | 0.533 | -0.217 | -0.167 |
| 1.847256480310812 | 0.533 | -0.218 | -0.166 |
| 1.850398072964402 | 0.533 | -0.22 | -0.165 |
| 1.853539665617991 | 0.533 | -0.221 | -0.165 |
| 1.856681258271581 | 0.533 | -0.222 | -0.164 |
| 1.859822850925171 | 0.533 | -0.224 | -0.163 |
| 1.862964443578761 | 0.533 | -0.225 | -0.162 |
| 1.866106036232351 | 0.533 | -0.226 | -0.161 |
| 1.86924762888594 | 0.533 | -0.227 | -0.16 |
| 1.87238922153953 | 0.533 | -0.229 | -0.16 |
| 1.87553081419312 | 0.533 | -0.23 | -0.159 |
| 1.87867240684671 | 0.533 | -0.231 | -0.158 |
| 1.8818139995003 | 0.533 | -0.232 | -0.157 |
| 1.88495559215389 | 0.533 | -0.233 | -0.155 |
| 1.888097184807479 | 0.533 | -0.234 | -0.154 |
| 1.891238777461069 | 0.533 | -0.235 | -0.153 |
| 1.89438037011466 | 0.533 | -0.236 | -0.152 |
| 1.897521962768249 | 0.533 | -0.237 | -0.151 |
| 1.900663555421839 | 0.533 | -0.238 | -0.15 |
| 1.903805148075429 | 0.533 | -0.239 | -0.148 |
| 1.906946740729018 | 0.533 | -0.24 | -0.147 |
| 1.910088333382608 | 0.533 | -0.241 | -0.146 |
| 1.913229926036198 | 0.533 | -0.242 | -0.144 |
| 1.916371518689788 | 0.533 | -0.243 | -0.143 |
| 1.919513111343378 | 0.533 | -0.244 | -0.141 |
| 1.922654703996967 | 0.533 | -0.245 | -0.14 |
| 1.925796296650557 | 0.533 | -0.245 | -0.138 |
| 1.928937889304147 | 0.533 | -0.246 | -0.136 |
| 1.932079481957737 | 0.533 | -0.247 | -0.135 |
| 1.935221074611327 | 0.533 | -0.248 | -0.133 |
| 1.938362667264917 | 0.533 | -0.248 | -0.131 |
| 1.941504259918506 | 0.533 | -0.249 | -0.129 |
| 1.944645852572096 | 0.533 | -0.25 | -0.128 |
| 1.947787445225686 | 0.533 | -0.25 | -0.126 |
| 1.950929037879276 | 0.533 | -0.251 | -0.124 |
| 1.954070630532866 | 0.533 | -0.252 | -0.122 |
| 1.957212223186455 | 0.533 | -0.252 | -0.12 |
| 1.960353815840045 | 0.533 | -0.253 | -0.118 |
| 1.963495408493635 | 0.533 | -0.253 | -0.116 |
| 1.966637001147225 | 0.533 | -0.254 | -0.114 |
| 1.969778593800815 | 0.533 | -0.254 | -0.111 |
| 1.972920186454405 | 0.533 | -0.255 | -0.109 |
| 1.976061779107994 | 0.533 | -0.255 | -0.107 |
| 1.979203371761584 | 0.533 | -0.256 | -0.105 |
| 1.982344964415174 | 0.533 | -0.256 | -0.102 |
| 1.985486557068764 | 0.533 | -0.257 | -0.1 |
| 1.988628149722354 | 0.533 | -0.257 | -0.097 |
| 1.991769742375943 | 0.533 | -0.258 | -0.095 |
| 1.994911335029533 | 0.532 | -0.258 | -0.093 |
| 1.998052927683123 | 0.532 | -0.259 | -0.09 |
| 2.001194520336712 | 0.532 | -0.259 | -0.087 |
| 2.004336112990302 | 0.532 | -0.259 | -0.085 |
| 2.007477705643892 | 0.532 | -0.26 | -0.082 |
| 2.010619298297482 | 0.532 | -0.26 | -0.08 |
| 2.013760890951071 | 0.532 | -0.26 | -0.077 |
| 2.016902483604661 | 0.532 | -0.261 | -0.074 |
| 2.02004407625825 | 0.532 | -0.261 | -0.071 |
| 2.02318566891184 | 0.532 | -0.261 | -0.069 |
| 2.02632726156543 | 0.532 | -0.261 | -0.066 |
| 2.029468854219019 | 0.532 | -0.262 | -0.063 |
| 2.032610446872609 | 0.532 | -0.262 | -0.06 |
| 2.035752039526198 | 0.532 | -0.262 | -0.057 |
| 2.038893632179788 | 0.532 | -0.262 | -0.054 |
| 2.042035224833378 | 0.532 | -0.263 | -0.051 |
| 2.045176817486967 | 0.532 | -0.263 | -0.048 |
| 2.048318410140557 | 0.532 | -0.263 | -0.045 |
| 2.051460002794146 | 0.532 | -0.263 | -0.042 |
| 2.054601595447736 | 0.531 | -0.263 | -0.039 |
| 2.057743188101325 | 0.531 | -0.264 | -0.036 |
| 2.060884780754915 | 0.531 | -0.264 | -0.033 |
| 2.064026373408505 | 0.531 | -0.264 | -0.03 |
| 2.067167966062094 | 0.531 | -0.264 | -0.027 |
| 2.070309558715684 | 0.531 | -0.264 | -0.024 |
| 2.073451151369273 | 0.531 | -0.264 | -0.021 |
| 2.076592744022863 | 0.531 | -0.265 | -0.018 |
| 2.079734336676452 | 0.531 | -0.265 | -0.015 |
| 2.082875929330042 | 0.531 | -0.265 | -0.012 |
| 2.086017521983632 | 0.531 | -0.265 | -0.008 |
| 2.089159114637221 | 0.531 | -0.265 | -0.005 |
| 2.092300707290811 | 0.531 | -0.265 | -0.002 |
| 2.095442299944401 | 0.53 | -0.265 | 0.001 |
| 2.09858389259799 | 0.53 | -0.265 | 0.004 |
| 2.10172548525158 | 0.53 | -0.265 | 0.007 |
| 2.104867077905169 | 0.53 | -0.266 | 0.01 |
| 2.108008670558759 | 0.53 | -0.266 | 0.014 |
| 2.111150263212349 | 0.53 | -0.266 | 0.017 |
| 2.114291855865938 | 0.53 | -0.266 | 0.02 |
| 2.117433448519528 | 0.53 | -0.266 | 0.023 |
| 2.120575041173117 | 0.53 | -0.266 | 0.026 |
| 2.123716633826707 | 0.529 | -0.266 | 0.029 |
| 2.126858226480297 | 0.529 | -0.266 | 0.032 |
| 2.129999819133886 | 0.529 | -0.266 | 0.035 |
| 2.133141411787476 | 0.529 | -0.266 | 0.038 |
| 2.136283004441065 | 0.529 | -0.266 | 0.041 |
| 2.139424597094655 | 0.529 | -0.266 | 0.044 |
| 2.142566189748245 | 0.529 | -0.266 | 0.047 |
| 2.145707782401834 | 0.528 | -0.266 | 0.05 |
| 2.148849375055424 | 0.528 | -0.266 | 0.053 |
| 2.151990967709013 | 0.528 | -0.266 | 0.056 |
| 2.155132560362603 | 0.528 | -0.266 | 0.059 |
| 2.158274153016193 | 0.528 | -0.266 | 0.062 |
| 2.161415745669782 | 0.528 | -0.266 | 0.065 |
| 2.164557338323372 | 0.527 | -0.266 | 0.068 |
| 2.167698930976961 | 0.527 | -0.266 | 0.07 |
| 2.170840523630551 | 0.527 | -0.266 | 0.073 |
| 2.173982116284141 | 0.527 | -0.266 | 0.076 |
| 2.17712370893773 | 0.527 | -0.267 | 0.079 |
| 2.18026530159132 | 0.527 | -0.267 | 0.081 |
| 2.183406894244909 | 0.526 | -0.267 | 0.084 |
| 2.186548486898499 | 0.526 | -0.267 | 0.087 |
| 2.189690079552089 | 0.526 | -0.267 | 0.089 |
| 2.192831672205678 | 0.526 | -0.267 | 0.092 |
| 2.195973264859268 | 0.526 | -0.267 | 0.094 |
| 2.199114857512857 | 0.525 | -0.267 | 0.097 |
| 2.202256450166447 | 0.525 | -0.267 | 0.099 |
| 2.205398042820036 | 0.525 | -0.267 | 0.101 |
| 2.208539635473626 | 0.525 | -0.267 | 0.104 |
| 2.211681228127216 | 0.524 | -0.267 | 0.106 |
| 2.214822820780805 | 0.524 | -0.267 | 0.108 |
| 2.217964413434395 | 0.524 | -0.267 | 0.111 |
| 2.221106006087984 | 0.524 | -0.267 | 0.113 |
| 2.224247598741574 | 0.523 | -0.267 | 0.115 |
| 2.227389191395164 | 0.523 | -0.267 | 0.117 |
| 2.230530784048753 | 0.523 | -0.267 | 0.119 |
| 2.233672376702343 | 0.523 | -0.267 | 0.121 |
| 2.236813969355933 | 0.522 | -0.267 | 0.123 |
| 2.239955562009522 | 0.522 | -0.267 | 0.125 |
| 2.243097154663112 | 0.522 | -0.267 | 0.127 |
| 2.246238747316701 | 0.521 | -0.267 | 0.129 |
| 2.249380339970291 | 0.521 | -0.267 | 0.131 |
| 2.252521932623881 | 0.521 | -0.267 | 0.132 |
| 2.25566352527747 | 0.521 | -0.267 | 0.134 |
| 2.25880511793106 | 0.52 | -0.267 | 0.136 |
| 2.261946710584649 | 0.52 | -0.267 | 0.137 |
| 2.265088303238239 | 0.52 | -0.267 | 0.139 |
| 2.268229895891829 | 0.519 | -0.267 | 0.141 |
| 2.271371488545418 | 0.519 | -0.267 | 0.142 |
| 2.274513081199008 | 0.518 | -0.267 | 0.144 |
| 2.277654673852597 | 0.518 | -0.267 | 0.145 |
| 2.280796266506186 | 0.518 | -0.267 | 0.146 |
| 2.283937859159776 | 0.517 | -0.267 | 0.148 |
| 2.287079451813366 | 0.517 | -0.267 | 0.149 |
| 2.290221044466955 | 0.517 | -0.267 | 0.15 |
| 2.293362637120545 | 0.516 | -0.267 | 0.152 |
| 2.296504229774135 | 0.516 | -0.267 | 0.153 |
| 2.299645822427724 | 0.515 | -0.267 | 0.154 |
| 2.302787415081314 | 0.515 | -0.267 | 0.155 |
| 2.305929007734904 | 0.515 | -0.267 | 0.156 |
| 2.309070600388493 | 0.514 | -0.267 | 0.157 |
| 2.312212193042083 | 0.514 | -0.267 | 0.158 |
| 2.315353785695672 | 0.513 | -0.267 | 0.159 |
| 2.318495378349262 | 0.513 | -0.267 | 0.16 |
| 2.321636971002852 | 0.512 | -0.267 | 0.161 |
| 2.324778563656441 | 0.512 | -0.267 | 0.162 |
| 2.327920156310031 | 0.511 | -0.267 | 0.163 |
| 2.33106174896362 | 0.511 | -0.267 | 0.164 |
| 2.33420334161721 | 0.51 | -0.267 | 0.164 |
| 2.3373449342708 | 0.51 | -0.267 | 0.165 |
| 2.340486526924389 | 0.509 | -0.267 | 0.166 |
| 2.343628119577979 | 0.509 | -0.267 | 0.166 |
| 2.346769712231568 | 0.508 | -0.267 | 0.167 |
| 2.349911304885158 | 0.508 | -0.267 | 0.168 |
| 2.353052897538748 | 0.507 | -0.267 | 0.168 |
| 2.356194490192337 | 0.507 | -0.267 | 0.169 |
| 2.359336082845927 | 0.506 | -0.267 | 0.169 |
| 2.362477675499516 | 0.506 | -0.267 | 0.17 |
| 2.365619268153106 | 0.505 | -0.267 | 0.17 |
| 2.368760860806696 | 0.504 | -0.267 | 0.171 |
| 2.371902453460285 | 0.504 | -0.267 | 0.171 |
| 2.375044046113875 | 0.503 | -0.267 | 0.172 |
| 2.378185638767464 | 0.503 | -0.267 | 0.172 |
| 2.381327231421054 | 0.502 | -0.267 | 0.173 |
| 2.384468824074644 | 0.501 | -0.267 | 0.173 |
| 2.387610416728233 | 0.501 | -0.267 | 0.173 |
| 2.390752009381823 | 0.5 | -0.267 | 0.174 |
| 2.393893602035412 | 0.499 | -0.267 | 0.174 |
| 2.397035194689002 | 0.499 | -0.267 | 0.174 |
| 2.400176787342591 | 0.498 | -0.267 | 0.174 |
| 2.403318379996181 | 0.497 | -0.267 | 0.175 |
| 2.406459972649771 | 0.497 | -0.267 | 0.175 |
| 2.40960156530336 | 0.496 | -0.267 | 0.175 |
| 2.41274315795695 | 0.495 | -0.267 | 0.175 |
| 2.41588475061054 | 0.495 | -0.267 | 0.176 |
| 2.419026343264129 | 0.494 | -0.267 | 0.176 |
| 2.422167935917719 | 0.493 | -0.267 | 0.176 |
| 2.425309528571308 | 0.492 | -0.267 | 0.176 |
| 2.428451121224898 | 0.492 | -0.267 | 0.176 |
| 2.431592713878488 | 0.491 | -0.267 | 0.176 |
| 2.434734306532077 | 0.49 | -0.267 | 0.177 |
| 2.437875899185667 | 0.489 | -0.267 | 0.177 |
| 2.441017491839256 | 0.488 | -0.267 | 0.177 |
| 2.444159084492846 | 0.487 | -0.267 | 0.177 |
| 2.447300677146435 | 0.487 | -0.267 | 0.177 |
| 2.450442269800025 | 0.486 | -0.267 | 0.177 |
| 2.453583862453615 | 0.485 | -0.267 | 0.177 |
| 2.456725455107204 | 0.484 | -0.267 | 0.177 |
| 2.459867047760794 | 0.483 | -0.267 | 0.177 |
| 2.463008640414384 | 0.482 | -0.267 | 0.177 |
| 2.466150233067973 | 0.481 | -0.267 | 0.177 |
| 2.469291825721563 | 0.48 | -0.267 | 0.177 |
| 2.472433418375152 | 0.48 | -0.267 | 0.177 |
| 2.475575011028742 | 0.479 | -0.267 | 0.177 |
| 2.478716603682332 | 0.478 | -0.267 | 0.178 |
| 2.481858196335921 | 0.477 | -0.267 | 0.178 |
| 2.48499978898951 | 0.476 | -0.267 | 0.178 |
| 2.4881413816431 | 0.475 | -0.267 | 0.178 |
| 2.49128297429669 | 0.474 | -0.267 | 0.178 |
| 2.49442456695028 | 0.473 | -0.267 | 0.178 |
| 2.497566159603869 | 0.472 | -0.267 | 0.178 |
| 2.500707752257458 | 0.471 | -0.267 | 0.178 |
| 2.503849344911048 | 0.47 | -0.267 | 0.178 |
| 2.506990937564638 | 0.469 | -0.267 | 0.178 |
| 2.510132530218228 | 0.468 | -0.267 | 0.178 |
| 2.513274122871817 | 0.466 | -0.267 | 0.178 |
| 2.516415715525407 | 0.465 | -0.267 | 0.178 |
| 2.519557308178996 | 0.464 | -0.267 | 0.178 |
| 2.522698900832586 | 0.463 | -0.267 | 0.178 |
| 2.525840493486176 | 0.462 | -0.267 | 0.178 |
| 2.528982086139765 | 0.461 | -0.267 | 0.178 |
| 2.532123678793355 | 0.46 | -0.267 | 0.178 |
| 2.535265271446944 | 0.459 | -0.267 | 0.178 |
| 2.538406864100534 | 0.457 | -0.266 | 0.178 |
| 2.541548456754124 | 0.456 | -0.266 | 0.178 |
| 2.544690049407713 | 0.455 | -0.266 | 0.178 |
| 2.547831642061302 | 0.454 | -0.266 | 0.178 |
| 2.550973234714892 | 0.452 | -0.266 | 0.178 |
| 2.554114827368482 | 0.451 | -0.266 | 0.178 |
| 2.557256420022072 | 0.45 | -0.266 | 0.178 |
| 2.560398012675661 | 0.449 | -0.266 | 0.178 |
| 2.563539605329251 | 0.447 | -0.266 | 0.178 |
| 2.56668119798284 | 0.446 | -0.266 | 0.178 |
| 2.56982279063643 | 0.445 | -0.266 | 0.178 |
| 2.57296438329002 | 0.443 | -0.266 | 0.178 |
| 2.576105975943609 | 0.442 | -0.266 | 0.178 |
| 2.579247568597199 | 0.441 | -0.266 | 0.178 |
| 2.582389161250788 | 0.439 | -0.266 | 0.178 |
| 2.585530753904377 | 0.438 | -0.266 | 0.178 |
| 2.588672346557967 | 0.437 | -0.266 | 0.178 |
| 2.591813939211557 | 0.435 | -0.266 | 0.178 |
| 2.594955531865147 | 0.434 | -0.266 | 0.178 |
| 2.598097124518736 | 0.432 | -0.266 | 0.178 |
| 2.601238717172326 | 0.431 | -0.266 | 0.178 |
| 2.604380309825915 | 0.429 | -0.266 | 0.178 |
| 2.607521902479505 | 0.428 | -0.266 | 0.178 |
| 2.610663495133095 | 0.426 | -0.265 | 0.178 |
| 2.613805087786684 | 0.425 | -0.265 | 0.178 |
| 2.616946680440274 | 0.423 | -0.265 | 0.178 |
| 2.620088273093863 | 0.422 | -0.265 | 0.178 |
| 2.623229865747452 | 0.42 | -0.265 | 0.178 |
| 2.626371458401042 | 0.419 | -0.265 | 0.178 |
| 2.629513051054632 | 0.417 | -0.265 | 0.178 |
| 2.632654643708222 | 0.416 | -0.265 | 0.178 |
| 2.635796236361811 | 0.414 | -0.265 | 0.178 |
| 2.638937829015401 | 0.412 | -0.264 | 0.178 |
| 2.642079421668991 | 0.411 | -0.264 | 0.178 |
| 2.64522101432258 | 0.409 | -0.264 | 0.178 |
| 2.64836260697617 | 0.407 | -0.264 | 0.178 |
| 2.651504199629759 | 0.406 | -0.264 | 0.178 |
| 2.654645792283349 | 0.404 | -0.264 | 0.178 |
| 2.657787384936938 | 0.402 | -0.263 | 0.178 |
| 2.660928977590528 | 0.401 | -0.263 | 0.178 |
| 2.664070570244118 | 0.399 | -0.263 | 0.178 |
| 2.667212162897707 | 0.397 | -0.263 | 0.178 |
| 2.670353755551297 | 0.395 | -0.263 | 0.178 |
| 2.673495348204887 | 0.394 | -0.262 | 0.178 |
| 2.676636940858476 | 0.392 | -0.262 | 0.178 |
| 2.679778533512066 | 0.39 | -0.262 | 0.178 |
| 2.682920126165655 | 0.388 | -0.262 | 0.178 |
| 2.686061718819245 | 0.386 | -0.261 | 0.178 |
| 2.689203311472835 | 0.385 | -0.261 | 0.178 |
| 2.692344904126424 | 0.383 | -0.261 | 0.178 |
| 2.695486496780014 | 0.381 | -0.261 | 0.178 |
| 2.698628089433603 | 0.379 | -0.26 | 0.178 |
| 2.701769682087193 | 0.377 | -0.26 | 0.178 |
| 2.704911274740782 | 0.375 | -0.26 | 0.178 |
| 2.708052867394372 | 0.373 | -0.259 | 0.178 |
| 2.711194460047962 | 0.371 | -0.259 | 0.178 |
| 2.714336052701551 | 0.369 | -0.259 | 0.178 |
| 2.717477645355141 | 0.367 | -0.258 | 0.178 |
| 2.720619238008731 | 0.365 | -0.258 | 0.178 |
| 2.72376083066232 | 0.363 | -0.257 | 0.178 |
| 2.72690242331591 | 0.361 | -0.257 | 0.178 |
| 2.730044015969499 | 0.359 | -0.256 | 0.178 |
| 2.733185608623089 | 0.357 | -0.256 | 0.178 |
| 2.736327201276678 | 0.355 | -0.255 | 0.178 |
| 2.739468793930268 | 0.353 | -0.255 | 0.178 |
| 2.742610386583858 | 0.351 | -0.254 | 0.178 |
| 2.745751979237447 | 0.349 | -0.254 | 0.178 |
| 2.748893571891036 | 0.347 | -0.253 | 0.178 |
| 2.752035164544627 | 0.345 | -0.253 | 0.178 |
| 2.755176757198216 | 0.343 | -0.252 | 0.178 |
| 2.758318349851806 | 0.341 | -0.252 | 0.178 |
| 2.761459942505395 | 0.338 | -0.251 | 0.177 |
| 2.764601535158985 | 0.336 | -0.25 | 0.177 |
| 2.767743127812574 | 0.334 | -0.25 | 0.177 |
| 2.770884720466164 | 0.332 | -0.249 | 0.177 |
| 2.774026313119754 | 0.33 | -0.248 | 0.177 |
| 2.777167905773343 | 0.327 | -0.248 | 0.177 |
| 2.780309498426932 | 0.325 | -0.247 | 0.177 |
| 2.783451091080522 | 0.323 | -0.246 | 0.177 |
| 2.786592683734112 | 0.321 | -0.245 | 0.177 |
| 2.789734276387701 | 0.318 | -0.245 | 0.177 |
| 2.792875869041291 | 0.316 | -0.244 | 0.177 |
| 2.796017461694881 | 0.314 | -0.243 | 0.177 |
| 2.79915905434847 | 0.311 | -0.242 | 0.177 |
| 2.80230064700206 | 0.309 | -0.241 | 0.176 |
| 2.80544223965565 | 0.307 | -0.24 | 0.176 |
| 2.808583832309239 | 0.304 | -0.239 | 0.176 |
| 2.811725424962829 | 0.302 | -0.238 | 0.176 |
| 2.814867017616419 | 0.3 | -0.237 | 0.176 |
| 2.818008610270008 | 0.297 | -0.236 | 0.176 |
| 2.821150202923598 | 0.295 | -0.235 | 0.176 |
| 2.824291795577187 | 0.292 | -0.234 | 0.175 |
| 2.827433388230777 | 0.29 | -0.233 | 0.175 |
| 2.830574980884366 | 0.287 | -0.232 | 0.175 |
| 2.833716573537956 | 0.285 | -0.231 | 0.175 |
| 2.836858166191546 | 0.283 | -0.23 | 0.174 |
| 2.839999758845135 | 0.28 | -0.229 | 0.174 |
| 2.843141351498725 | 0.278 | -0.227 | 0.174 |
| 2.846282944152314 | 0.275 | -0.226 | 0.174 |
| 2.849424536805904 | 0.272 | -0.225 | 0.173 |
| 2.852566129459494 | 0.27 | -0.224 | 0.173 |
| 2.855707722113083 | 0.267 | -0.222 | 0.172 |
| 2.858849314766673 | 0.265 | -0.221 | 0.172 |
| 2.861990907420262 | 0.262 | -0.22 | 0.172 |
| 2.865132500073852 | 0.26 | -0.218 | 0.171 |
| 2.868274092727442 | 0.257 | -0.217 | 0.171 |
| 2.871415685381031 | 0.254 | -0.215 | 0.17 |
| 2.874557278034621 | 0.252 | -0.214 | 0.17 |
| 2.87769887068821 | 0.249 | -0.212 | 0.169 |
| 2.8808404633418 | 0.247 | -0.211 | 0.169 |
| 2.88398205599539 | 0.244 | -0.209 | 0.168 |
| 2.88712364864898 | 0.241 | -0.208 | 0.168 |
| 2.890265241302569 | 0.239 | -0.206 | 0.167 |
| 2.893406833956158 | 0.236 | -0.205 | 0.166 |
| 2.896548426609748 | 0.233 | -0.203 | 0.166 |
| 2.899690019263338 | 0.231 | -0.201 | 0.165 |
| 2.902831611916927 | 0.228 | -0.199 | 0.164 |
| 2.905973204570517 | 0.225 | -0.198 | 0.163 |
| 2.909114797224106 | 0.222 | -0.196 | 0.162 |
| 2.912256389877696 | 0.22 | -0.194 | 0.162 |
| 2.915397982531286 | 0.217 | -0.192 | 0.161 |
| 2.918539575184875 | 0.214 | -0.19 | 0.16 |
| 2.921681167838465 | 0.211 | -0.189 | 0.159 |
| 2.924822760492054 | 0.209 | -0.187 | 0.158 |
| 2.927964353145644 | 0.206 | -0.185 | 0.157 |
| 2.931105945799234 | 0.203 | -0.183 | 0.156 |
| 2.934247538452823 | 0.2 | -0.181 | 0.155 |
| 2.937389131106413 | 0.197 | -0.179 | 0.154 |
| 2.940530723760002 | 0.194 | -0.177 | 0.152 |
| 2.943672316413592 | 0.192 | -0.175 | 0.151 |
| 2.946813909067182 | 0.189 | -0.172 | 0.15 |
| 2.949955501720771 | 0.186 | -0.17 | 0.149 |
| 2.953097094374361 | 0.183 | -0.168 | 0.147 |
| 2.95623868702795 | 0.18 | -0.166 | 0.146 |
| 2.95938027968154 | 0.177 | -0.164 | 0.145 |
| 2.96252187233513 | 0.174 | -0.161 | 0.143 |
| 2.965663464988719 | 0.171 | -0.159 | 0.142 |
| 2.968805057642309 | 0.169 | -0.157 | 0.14 |
| 2.971946650295898 | 0.166 | -0.155 | 0.139 |
| 2.975088242949488 | 0.163 | -0.152 | 0.137 |
| 2.978229835603078 | 0.16 | -0.15 | 0.135 |
| 2.981371428256667 | 0.157 | -0.147 | 0.134 |
| 2.984513020910257 | 0.154 | -0.145 | 0.132 |
| 2.987654613563846 | 0.151 | -0.142 | 0.13 |
| 2.990796206217436 | 0.148 | -0.14 | 0.128 |
| 2.993937798871025 | 0.145 | -0.138 | 0.126 |
| 2.997079391524615 | 0.142 | -0.135 | 0.124 |
| 3.000220984178205 | 0.139 | -0.132 | 0.122 |
| 3.003362576831794 | 0.136 | -0.13 | 0.12 |
| 3.006504169485384 | 0.133 | -0.127 | 0.118 |
| 3.009645762138974 | 0.13 | -0.125 | 0.116 |
| 3.012787354792563 | 0.127 | -0.122 | 0.114 |
| 3.015928947446153 | 0.124 | -0.119 | 0.112 |
| 3.019070540099742 | 0.121 | -0.117 | 0.11 |
| 3.022212132753332 | 0.118 | -0.114 | 0.108 |
| 3.025353725406922 | 0.115 | -0.111 | 0.105 |
| 3.028495318060511 | 0.112 | -0.108 | 0.103 |
| 3.031636910714101 | 0.109 | -0.106 | 0.101 |
| 3.03477850336769 | 0.106 | -0.103 | 0.098 |
| 3.03792009602128 | 0.103 | -0.1 | 0.096 |
| 3.04106168867487 | 0.1 | -0.097 | 0.093 |
| 3.04420328132846 | 0.097 | -0.094 | 0.091 |
| 3.047344873982049 | 0.094 | -0.092 | 0.088 |
| 3.050486466635638 | 0.09 | -0.089 | 0.086 |
| 3.053628059289228 | 0.087 | -0.086 | 0.083 |
| 3.056769651942818 | 0.084 | -0.083 | 0.08 |
| 3.059911244596407 | 0.081 | -0.08 | 0.078 |
| 3.063052837249997 | 0.078 | -0.077 | 0.075 |
| 3.066194429903586 | 0.075 | -0.074 | 0.072 |
| 3.069336022557176 | 0.072 | -0.071 | 0.07 |
| 3.072477615210766 | 0.069 | -0.068 | 0.067 |
| 3.075619207864355 | 0.066 | -0.065 | 0.064 |
| 3.078760800517945 | 0.063 | -0.062 | 0.061 |
| 3.081902393171534 | 0.06 | -0.059 | 0.058 |
| 3.085043985825124 | 0.056 | -0.056 | 0.055 |
| 3.088185578478713 | 0.053 | -0.053 | 0.052 |
| 3.091327171132303 | 0.05 | -0.05 | 0.049 |
| 3.094468763785893 | 0.047 | -0.047 | 0.046 |
| 3.097610356439482 | 0.044 | -0.044 | 0.043 |
| 3.100751949093072 | 0.041 | -0.041 | 0.04 |
| 3.103893541746661 | 0.038 | -0.038 | 0.037 |
| 3.107035134400251 | 0.035 | -0.034 | 0.034 |
| 3.110176727053841 | 0.031 | -0.031 | 0.031 |
| 3.11331831970743 | 0.028 | -0.028 | 0.028 |
| 3.11645991236102 | 0.025 | -0.025 | 0.025 |
| 3.11960150501461 | 0.022 | -0.022 | 0.022 |
| 3.122743097668199 | 0.019 | -0.019 | 0.019 |
| 3.125884690321789 | 0.016 | -0.016 | 0.016 |
| 3.129026282975378 | 0.013 | -0.013 | 0.013 |
| 3.132167875628968 | 0.009 | -0.009 | 0.009 |
| 3.135309468282557 | 0.006 | -0.006 | 0.006 |
| 3.138451060936147 | 0.003 | -0.003 | 0.003 |
| 3.141592653589737 | 0 | 0 | 0 |
| 3.144734246243326 | -0.003 | 0.003 | -0.003 |
| 3.147875838896916 | -0.006 | 0.006 | -0.006 |
| 3.151017431550505 | -0.009 | 0.009 | -0.009 |
| 3.154159024204095 | -0.013 | 0.013 | -0.013 |
| 3.157300616857685 | -0.016 | 0.016 | -0.016 |
| 3.160442209511274 | -0.019 | 0.019 | -0.019 |
| 3.163583802164864 | -0.022 | 0.022 | -0.022 |
| 3.166725394818453 | -0.025 | 0.025 | -0.025 |
| 3.169866987472043 | -0.028 | 0.028 | -0.028 |
| 3.173008580125633 | -0.031 | 0.031 | -0.031 |
| 3.176150172779222 | -0.035 | 0.034 | -0.034 |
| 3.179291765432812 | -0.038 | 0.038 | -0.037 |
| 3.182433358086401 | -0.041 | 0.041 | -0.04 |
| 3.185574950739991 | -0.044 | 0.044 | -0.043 |
| 3.188716543393581 | -0.047 | 0.047 | -0.046 |
| 3.19185813604717 | -0.05 | 0.05 | -0.049 |
| 3.19499972870076 | -0.053 | 0.053 | -0.052 |
| 3.198141321354349 | -0.056 | 0.056 | -0.055 |
| 3.20128291400794 | -0.06 | 0.059 | -0.058 |
| 3.204424506661528 | -0.063 | 0.062 | -0.061 |
| 3.207566099315118 | -0.066 | 0.065 | -0.064 |
| 3.210707691968708 | -0.069 | 0.068 | -0.067 |
| 3.213849284622297 | -0.072 | 0.071 | -0.07 |
| 3.216990877275887 | -0.075 | 0.074 | -0.072 |
| 3.220132469929476 | -0.078 | 0.077 | -0.075 |
| 3.223274062583066 | -0.081 | 0.08 | -0.078 |
| 3.226415655236656 | -0.084 | 0.083 | -0.08 |
| 3.229557247890245 | -0.087 | 0.086 | -0.083 |
| 3.232698840543835 | -0.09 | 0.089 | -0.086 |
| 3.235840433197425 | -0.094 | 0.092 | -0.088 |
| 3.238982025851014 | -0.097 | 0.094 | -0.091 |
| 3.242123618504604 | -0.1 | 0.097 | -0.093 |
| 3.245265211158193 | -0.103 | 0.1 | -0.096 |
| 3.248406803811783 | -0.106 | 0.103 | -0.098 |
| 3.251548396465373 | -0.109 | 0.106 | -0.101 |
| 3.254689989118962 | -0.112 | 0.108 | -0.103 |
| 3.257831581772551 | -0.115 | 0.111 | -0.105 |
| 3.260973174426141 | -0.118 | 0.114 | -0.108 |
| 3.26411476707973 | -0.121 | 0.117 | -0.11 |
| 3.267256359733321 | -0.124 | 0.119 | -0.112 |
| 3.27039795238691 | -0.127 | 0.122 | -0.114 |
| 3.2735395450405 | -0.13 | 0.125 | -0.116 |
| 3.276681137694089 | -0.133 | 0.127 | -0.118 |
| 3.279822730347679 | -0.136 | 0.13 | -0.12 |
| 3.282964323001269 | -0.139 | 0.132 | -0.122 |
| 3.286105915654858 | -0.142 | 0.135 | -0.124 |
| 3.289247508308448 | -0.145 | 0.138 | -0.126 |
| 3.292389100962037 | -0.148 | 0.14 | -0.128 |
| 3.295530693615627 | -0.151 | 0.142 | -0.13 |
| 3.298672286269217 | -0.154 | 0.145 | -0.132 |
| 3.301813878922806 | -0.157 | 0.147 | -0.134 |
| 3.304955471576396 | -0.16 | 0.15 | -0.135 |
| 3.308097064229985 | -0.163 | 0.152 | -0.137 |
| 3.311238656883575 | -0.166 | 0.155 | -0.139 |
| 3.314380249537165 | -0.169 | 0.157 | -0.14 |
| 3.317521842190754 | -0.171 | 0.159 | -0.142 |
| 3.320663434844344 | -0.174 | 0.161 | -0.143 |
| 3.323805027497933 | -0.177 | 0.164 | -0.145 |
| 3.326946620151523 | -0.18 | 0.166 | -0.146 |
| 3.330088212805113 | -0.183 | 0.168 | -0.147 |
| 3.333229805458702 | -0.186 | 0.17 | -0.149 |
| 3.336371398112292 | -0.189 | 0.172 | -0.15 |
| 3.339512990765881 | -0.192 | 0.175 | -0.151 |
| 3.342654583419471 | -0.194 | 0.177 | -0.152 |
| 3.345796176073061 | -0.197 | 0.179 | -0.154 |
| 3.34893776872665 | -0.2 | 0.181 | -0.155 |
| 3.35207936138024 | -0.203 | 0.183 | -0.156 |
| 3.355220954033829 | -0.206 | 0.185 | -0.157 |
| 3.358362546687419 | -0.209 | 0.187 | -0.158 |
| 3.361504139341009 | -0.211 | 0.189 | -0.159 |
| 3.364645731994598 | -0.214 | 0.19 | -0.16 |
| 3.367787324648188 | -0.217 | 0.192 | -0.161 |
| 3.370928917301777 | -0.22 | 0.194 | -0.162 |
| 3.374070509955367 | -0.222 | 0.196 | -0.162 |
| 3.377212102608956 | -0.225 | 0.198 | -0.163 |
| 3.380353695262546 | -0.228 | 0.199 | -0.164 |
| 3.383495287916136 | -0.231 | 0.201 | -0.165 |
| 3.386636880569725 | -0.233 | 0.203 | -0.166 |
| 3.389778473223315 | -0.236 | 0.205 | -0.166 |
| 3.392920065876904 | -0.239 | 0.206 | -0.167 |
| 3.396061658530494 | -0.241 | 0.208 | -0.168 |
| 3.399203251184084 | -0.244 | 0.209 | -0.168 |
| 3.402344843837673 | -0.247 | 0.211 | -0.169 |
| 3.405486436491263 | -0.249 | 0.212 | -0.169 |
| 3.408628029144852 | -0.252 | 0.214 | -0.17 |
| 3.411769621798442 | -0.254 | 0.215 | -0.17 |
| 3.414911214452032 | -0.257 | 0.217 | -0.171 |
| 3.418052807105621 | -0.26 | 0.218 | -0.171 |
| 3.421194399759211 | -0.262 | 0.22 | -0.172 |
| 3.4243359924128 | -0.265 | 0.221 | -0.172 |
| 3.42747758506639 | -0.267 | 0.222 | -0.172 |
| 3.43061917771998 | -0.27 | 0.224 | -0.173 |
| 3.433760770373569 | -0.272 | 0.225 | -0.173 |
| 3.436902363027159 | -0.275 | 0.226 | -0.174 |
| 3.440043955680748 | -0.278 | 0.227 | -0.174 |
| 3.443185548334338 | -0.28 | 0.229 | -0.174 |
| 3.446327140987927 | -0.283 | 0.23 | -0.174 |
| 3.449468733641517 | -0.285 | 0.231 | -0.175 |
| 3.452610326295107 | -0.287 | 0.232 | -0.175 |
| 3.455751918948696 | -0.29 | 0.233 | -0.175 |
| 3.458893511602286 | -0.292 | 0.234 | -0.175 |
| 3.462035104255876 | -0.295 | 0.235 | -0.176 |
| 3.465176696909465 | -0.297 | 0.236 | -0.176 |
| 3.468318289563055 | -0.3 | 0.237 | -0.176 |
| 3.471459882216644 | -0.302 | 0.238 | -0.176 |
| 3.474601474870234 | -0.304 | 0.239 | -0.176 |
| 3.477743067523824 | -0.307 | 0.24 | -0.176 |
| 3.480884660177413 | -0.309 | 0.241 | -0.176 |
| 3.484026252831002 | -0.311 | 0.242 | -0.177 |
| 3.487167845484592 | -0.314 | 0.243 | -0.177 |
| 3.490309438138182 | -0.316 | 0.244 | -0.177 |
| 3.493451030791772 | -0.318 | 0.245 | -0.177 |
| 3.496592623445361 | -0.321 | 0.245 | -0.177 |
| 3.499734216098951 | -0.323 | 0.246 | -0.177 |
| 3.50287580875254 | -0.325 | 0.247 | -0.177 |
| 3.50601740140613 | -0.327 | 0.248 | -0.177 |
| 3.50915899405972 | -0.33 | 0.248 | -0.177 |
| 3.512300586713309 | -0.332 | 0.249 | -0.177 |
| 3.515442179366899 | -0.334 | 0.25 | -0.177 |
| 3.518583772020488 | -0.336 | 0.25 | -0.177 |
| 3.521725364674078 | -0.338 | 0.251 | -0.177 |
| 3.524866957327668 | -0.341 | 0.252 | -0.178 |
| 3.528008549981257 | -0.343 | 0.252 | -0.178 |
| 3.531150142634847 | -0.345 | 0.253 | -0.178 |
| 3.534291735288436 | -0.347 | 0.253 | -0.178 |
| 3.537433327942026 | -0.349 | 0.254 | -0.178 |
| 3.540574920595616 | -0.351 | 0.254 | -0.178 |
| 3.543716513249205 | -0.353 | 0.255 | -0.178 |
| 3.546858105902795 | -0.355 | 0.255 | -0.178 |
| 3.549999698556384 | -0.357 | 0.256 | -0.178 |
| 3.553141291209974 | -0.359 | 0.256 | -0.178 |
| 3.556282883863564 | -0.361 | 0.257 | -0.178 |
| 3.559424476517153 | -0.363 | 0.257 | -0.178 |
| 3.562566069170743 | -0.365 | 0.258 | -0.178 |
| 3.565707661824332 | -0.367 | 0.258 | -0.178 |
| 3.568849254477922 | -0.369 | 0.259 | -0.178 |
| 3.571990847131511 | -0.371 | 0.259 | -0.178 |
| 3.575132439785101 | -0.373 | 0.259 | -0.178 |
| 3.578274032438691 | -0.375 | 0.26 | -0.178 |
| 3.58141562509228 | -0.377 | 0.26 | -0.178 |
| 3.58455721774587 | -0.379 | 0.26 | -0.178 |
| 3.58769881039946 | -0.381 | 0.261 | -0.178 |
| 3.590840403053049 | -0.383 | 0.261 | -0.178 |
| 3.593981995706639 | -0.385 | 0.261 | -0.178 |
| 3.597123588360228 | -0.386 | 0.261 | -0.178 |
| 3.600265181013818 | -0.388 | 0.262 | -0.178 |
| 3.603406773667407 | -0.39 | 0.262 | -0.178 |
| 3.606548366320997 | -0.392 | 0.262 | -0.178 |
| 3.609689958974587 | -0.394 | 0.262 | -0.178 |
| 3.612831551628176 | -0.395 | 0.263 | -0.178 |
| 3.615973144281766 | -0.397 | 0.263 | -0.178 |
| 3.619114736935355 | -0.399 | 0.263 | -0.178 |
| 3.622256329588945 | -0.401 | 0.263 | -0.178 |
| 3.625397922242534 | -0.402 | 0.263 | -0.178 |
| 3.628539514896124 | -0.404 | 0.264 | -0.178 |
| 3.631681107549714 | -0.406 | 0.264 | -0.178 |
| 3.634822700203303 | -0.407 | 0.264 | -0.178 |
| 3.637964292856893 | -0.409 | 0.264 | -0.178 |
| 3.641105885510483 | -0.411 | 0.264 | -0.178 |
| 3.644247478164072 | -0.412 | 0.264 | -0.178 |
| 3.647389070817662 | -0.414 | 0.265 | -0.178 |
| 3.650530663471251 | -0.416 | 0.265 | -0.178 |
| 3.653672256124841 | -0.417 | 0.265 | -0.178 |
| 3.656813848778431 | -0.419 | 0.265 | -0.178 |
| 3.65995544143202 | -0.42 | 0.265 | -0.178 |
| 3.66309703408561 | -0.422 | 0.265 | -0.178 |
| 3.666238626739199 | -0.423 | 0.265 | -0.178 |
| 3.66938021939279 | -0.425 | 0.265 | -0.178 |
| 3.672521812046378 | -0.426 | 0.265 | -0.178 |
| 3.675663404699968 | -0.428 | 0.266 | -0.178 |
| 3.678804997353558 | -0.429 | 0.266 | -0.178 |
| 3.681946590007147 | -0.431 | 0.266 | -0.178 |
| 3.685088182660737 | -0.432 | 0.266 | -0.178 |
| 3.688229775314326 | -0.434 | 0.266 | -0.178 |
| 3.691371367967916 | -0.435 | 0.266 | -0.178 |
| 3.694512960621506 | -0.437 | 0.266 | -0.178 |
| 3.697654553275095 | -0.438 | 0.266 | -0.178 |
| 3.700796145928685 | -0.439 | 0.266 | -0.178 |
| 3.703937738582274 | -0.441 | 0.266 | -0.178 |
| 3.707079331235864 | -0.442 | 0.266 | -0.178 |
| 3.710220923889454 | -0.443 | 0.266 | -0.178 |
| 3.713362516543043 | -0.445 | 0.266 | -0.178 |
| 3.716504109196633 | -0.446 | 0.266 | -0.178 |
| 3.719645701850223 | -0.447 | 0.266 | -0.178 |
| 3.722787294503812 | -0.449 | 0.266 | -0.178 |
| 3.725928887157402 | -0.45 | 0.266 | -0.178 |
| 3.729070479810991 | -0.451 | 0.266 | -0.178 |
| 3.732212072464581 | -0.452 | 0.266 | -0.178 |
| 3.735353665118171 | -0.454 | 0.266 | -0.178 |
| 3.73849525777176 | -0.455 | 0.266 | -0.178 |
| 3.74163685042535 | -0.456 | 0.266 | -0.178 |
| 3.744778443078939 | -0.457 | 0.266 | -0.178 |
| 3.747920035732529 | -0.459 | 0.267 | -0.178 |
| 3.751061628386119 | -0.46 | 0.267 | -0.178 |
| 3.754203221039708 | -0.461 | 0.267 | -0.178 |
| 3.757344813693298 | -0.462 | 0.267 | -0.178 |
| 3.760486406346887 | -0.463 | 0.267 | -0.178 |
| 3.763627999000477 | -0.464 | 0.267 | -0.178 |
| 3.766769591654067 | -0.465 | 0.267 | -0.178 |
| 3.769911184307656 | -0.466 | 0.267 | -0.178 |
| 3.773052776961246 | -0.468 | 0.267 | -0.178 |
| 3.776194369614835 | -0.469 | 0.267 | -0.178 |
| 3.779335962268425 | -0.47 | 0.267 | -0.178 |
| 3.782477554922014 | -0.471 | 0.267 | -0.178 |
| 3.785619147575604 | -0.472 | 0.267 | -0.178 |
| 3.788760740229193 | -0.473 | 0.267 | -0.178 |
| 3.791902332882783 | -0.474 | 0.267 | -0.178 |
| 3.795043925536373 | -0.475 | 0.267 | -0.178 |
| 3.798185518189962 | -0.476 | 0.267 | -0.178 |
| 3.801327110843552 | -0.477 | 0.267 | -0.178 |
| 3.804468703497142 | -0.478 | 0.267 | -0.178 |
| 3.807610296150731 | -0.479 | 0.267 | -0.177 |
| 3.810751888804321 | -0.48 | 0.267 | -0.177 |
| 3.813893481457911 | -0.48 | 0.267 | -0.177 |
| 3.8170350741115 | -0.481 | 0.267 | -0.177 |
| 3.82017666676509 | -0.482 | 0.267 | -0.177 |
| 3.823318259418679 | -0.483 | 0.267 | -0.177 |
| 3.826459852072269 | -0.484 | 0.267 | -0.177 |
| 3.829601444725859 | -0.485 | 0.267 | -0.177 |
| 3.832743037379448 | -0.486 | 0.267 | -0.177 |
| 3.835884630033038 | -0.487 | 0.267 | -0.177 |
| 3.839026222686627 | -0.487 | 0.267 | -0.177 |
| 3.842167815340217 | -0.488 | 0.267 | -0.177 |
| 3.845309407993807 | -0.489 | 0.267 | -0.177 |
| 3.848451000647396 | -0.49 | 0.267 | -0.177 |
| 3.851592593300986 | -0.491 | 0.267 | -0.176 |
| 3.854734185954575 | -0.492 | 0.267 | -0.176 |
| 3.857875778608165 | -0.492 | 0.267 | -0.176 |
| 3.861017371261755 | -0.493 | 0.267 | -0.176 |
| 3.864158963915344 | -0.494 | 0.267 | -0.176 |
| 3.867300556568933 | -0.495 | 0.267 | -0.176 |
| 3.870442149222523 | -0.495 | 0.267 | -0.175 |
| 3.873583741876112 | -0.496 | 0.267 | -0.175 |
| 3.876725334529703 | -0.497 | 0.267 | -0.175 |
| 3.879866927183292 | -0.497 | 0.267 | -0.175 |
| 3.883008519836882 | -0.498 | 0.267 | -0.174 |
| 3.886150112490471 | -0.499 | 0.267 | -0.174 |
| 3.889291705144061 | -0.499 | 0.267 | -0.174 |
| 3.892433297797651 | -0.5 | 0.267 | -0.174 |
| 3.89557489045124 | -0.501 | 0.267 | -0.173 |
| 3.89871648310483 | -0.501 | 0.267 | -0.173 |
| 3.901858075758419 | -0.502 | 0.267 | -0.173 |
| 3.904999668412009 | -0.503 | 0.267 | -0.172 |
| 3.908141261065598 | -0.503 | 0.267 | -0.172 |
| 3.911282853719188 | -0.504 | 0.267 | -0.171 |
| 3.914424446372778 | -0.504 | 0.267 | -0.171 |
| 3.917566039026367 | -0.505 | 0.267 | -0.17 |
| 3.920707631679957 | -0.506 | 0.267 | -0.17 |
| 3.923849224333547 | -0.506 | 0.267 | -0.169 |
| 3.926990816987136 | -0.507 | 0.267 | -0.169 |
| 3.930132409640726 | -0.507 | 0.267 | -0.168 |
| 3.933274002294315 | -0.508 | 0.267 | -0.168 |
| 3.936415594947905 | -0.508 | 0.267 | -0.167 |
| 3.939557187601495 | -0.509 | 0.267 | -0.166 |
| 3.942698780255084 | -0.509 | 0.267 | -0.166 |
| 3.945840372908674 | -0.51 | 0.267 | -0.165 |
| 3.948981965562263 | -0.51 | 0.267 | -0.164 |
| 3.952123558215853 | -0.511 | 0.267 | -0.164 |
| 3.955265150869442 | -0.511 | 0.267 | -0.163 |
| 3.958406743523032 | -0.512 | 0.267 | -0.162 |
| 3.961548336176622 | -0.512 | 0.267 | -0.161 |
| 3.964689928830211 | -0.513 | 0.267 | -0.16 |
| 3.967831521483801 | -0.513 | 0.267 | -0.159 |
| 3.97097311413739 | -0.514 | 0.267 | -0.158 |
| 3.97411470679098 | -0.514 | 0.267 | -0.157 |
| 3.97725629944457 | -0.515 | 0.267 | -0.156 |
| 3.98039789209816 | -0.515 | 0.267 | -0.155 |
| 3.983539484751749 | -0.515 | 0.267 | -0.154 |
| 3.986681077405338 | -0.516 | 0.267 | -0.153 |
| 3.989822670058928 | -0.516 | 0.267 | -0.152 |
| 3.992964262712517 | -0.517 | 0.267 | -0.15 |
| 3.996105855366107 | -0.517 | 0.267 | -0.149 |
| 3.999247448019697 | -0.517 | 0.267 | -0.148 |
| 4.002389040673287 | -0.518 | 0.267 | -0.146 |
| 4.005530633326877 | -0.518 | 0.267 | -0.145 |
| 4.008672225980466 | -0.518 | 0.267 | -0.144 |
| 4.011813818634056 | -0.519 | 0.267 | -0.142 |
| 4.014955411287645 | -0.519 | 0.267 | -0.141 |
| 4.018097003941234 | -0.52 | 0.267 | -0.139 |
| 4.021238596594824 | -0.52 | 0.267 | -0.137 |
| 4.024380189248414 | -0.52 | 0.267 | -0.136 |
| 4.027521781902004 | -0.521 | 0.267 | -0.134 |
| 4.030663374555593 | -0.521 | 0.267 | -0.132 |
| 4.033804967209183 | -0.521 | 0.267 | -0.131 |
| 4.036946559862773 | -0.521 | 0.267 | -0.129 |
| 4.040088152516362 | -0.522 | 0.267 | -0.127 |
| 4.043229745169951 | -0.522 | 0.267 | -0.125 |
| 4.046371337823541 | -0.522 | 0.267 | -0.123 |
| 4.049512930477131 | -0.523 | 0.267 | -0.121 |
| 4.05265452313072 | -0.523 | 0.267 | -0.119 |
| 4.05579611578431 | -0.523 | 0.267 | -0.117 |
| 4.0589377084379 | -0.523 | 0.267 | -0.115 |
| 4.062079301091489 | -0.524 | 0.267 | -0.113 |
| 4.065220893745079 | -0.524 | 0.267 | -0.111 |
| 4.068362486398668 | -0.524 | 0.267 | -0.108 |
| 4.071504079052258 | -0.524 | 0.267 | -0.106 |
| 4.074645671705848 | -0.525 | 0.267 | -0.104 |
| 4.077787264359437 | -0.525 | 0.267 | -0.101 |
| 4.080928857013027 | -0.525 | 0.267 | -0.099 |
| 4.084070449666616 | -0.525 | 0.267 | -0.097 |
| 4.087212042320206 | -0.526 | 0.267 | -0.094 |
| 4.090353634973795 | -0.526 | 0.267 | -0.092 |
| 4.093495227627385 | -0.526 | 0.267 | -0.089 |
| 4.096636820280975 | -0.526 | 0.267 | -0.087 |
| 4.099778412934564 | -0.526 | 0.267 | -0.084 |
| 4.102920005588154 | -0.527 | 0.267 | -0.081 |
| 4.106061598241744 | -0.527 | 0.267 | -0.079 |
| 4.109203190895333 | -0.527 | 0.266 | -0.076 |
| 4.112344783548923 | -0.527 | 0.266 | -0.073 |
| 4.115486376202512 | -0.527 | 0.266 | -0.07 |
| 4.118627968856102 | -0.527 | 0.266 | -0.068 |
| 4.121769561509692 | -0.528 | 0.266 | -0.065 |
| 4.124911154163281 | -0.528 | 0.266 | -0.062 |
| 4.128052746816871 | -0.528 | 0.266 | -0.059 |
| 4.13119433947046 | -0.528 | 0.266 | -0.056 |
| 4.13433593212405 | -0.528 | 0.266 | -0.053 |
| 4.13747752477764 | -0.528 | 0.266 | -0.05 |
| 4.14061911743123 | -0.529 | 0.266 | -0.047 |
| 4.143760710084818 | -0.529 | 0.266 | -0.044 |
| 4.146902302738408 | -0.529 | 0.266 | -0.041 |
| 4.150043895391998 | -0.529 | 0.266 | -0.038 |
| 4.153185488045588 | -0.529 | 0.266 | -0.035 |
| 4.156327080699177 | -0.529 | 0.266 | -0.032 |
| 4.159468673352766 | -0.529 | 0.266 | -0.029 |
| 4.162610266006356 | -0.53 | 0.266 | -0.026 |
| 4.165751858659946 | -0.53 | 0.266 | -0.023 |
| 4.168893451313535 | -0.53 | 0.266 | -0.02 |
| 4.172035043967125 | -0.53 | 0.266 | -0.017 |
| 4.175176636620715 | -0.53 | 0.266 | -0.014 |
| 4.178318229274304 | -0.53 | 0.266 | -0.01 |
| 4.181459821927894 | -0.53 | 0.265 | -0.007 |
| 4.184601414581484 | -0.53 | 0.265 | -0.004 |
| 4.187743007235073 | -0.53 | 0.265 | -0.001 |
| 4.190884599888663 | -0.531 | 0.265 | 0.002 |
| 4.194026192542252 | -0.531 | 0.265 | 0.005 |
| 4.197167785195842 | -0.531 | 0.265 | 0.008 |
| 4.200309377849432 | -0.531 | 0.265 | 0.012 |
| 4.203450970503021 | -0.531 | 0.265 | 0.015 |
| 4.206592563156611 | -0.531 | 0.265 | 0.018 |
| 4.2097341558102 | -0.531 | 0.264 | 0.021 |
| 4.21287574846379 | -0.531 | 0.264 | 0.024 |
| 4.21601734111738 | -0.531 | 0.264 | 0.027 |
| 4.21915893377097 | -0.531 | 0.264 | 0.03 |
| 4.222300526424559 | -0.531 | 0.264 | 0.033 |
| 4.225442119078148 | -0.531 | 0.264 | 0.036 |
| 4.228583711731738 | -0.531 | 0.263 | 0.039 |
| 4.231725304385327 | -0.532 | 0.263 | 0.042 |
| 4.234866897038917 | -0.532 | 0.263 | 0.045 |
| 4.238008489692506 | -0.532 | 0.263 | 0.048 |
| 4.241150082346096 | -0.532 | 0.263 | 0.051 |
| 4.244291674999685 | -0.532 | 0.262 | 0.054 |
| 4.247433267653276 | -0.532 | 0.262 | 0.057 |
| 4.250574860306865 | -0.532 | 0.262 | 0.06 |
| 4.253716452960455 | -0.532 | 0.262 | 0.063 |
| 4.256858045614044 | -0.532 | 0.261 | 0.066 |
| 4.259999638267634 | -0.532 | 0.261 | 0.069 |
| 4.263141230921224 | -0.532 | 0.261 | 0.071 |
| 4.266282823574813 | -0.532 | 0.261 | 0.074 |
| 4.269424416228403 | -0.532 | 0.26 | 0.077 |
| 4.272566008881992 | -0.532 | 0.26 | 0.08 |
| 4.275707601535582 | -0.532 | 0.26 | 0.082 |
| 4.27884919418917 | -0.532 | 0.259 | 0.085 |
| 4.28199078684276 | -0.532 | 0.259 | 0.087 |
| 4.285132379496351 | -0.532 | 0.259 | 0.09 |
| 4.28827397214994 | -0.532 | 0.258 | 0.093 |
| 4.29141556480353 | -0.533 | 0.258 | 0.095 |
| 4.294557157457119 | -0.533 | 0.257 | 0.097 |
| 4.29769875011071 | -0.533 | 0.257 | 0.1 |
| 4.300840342764299 | -0.533 | 0.256 | 0.102 |
| 4.303981935417888 | -0.533 | 0.256 | 0.105 |
| 4.307123528071478 | -0.533 | 0.255 | 0.107 |
| 4.310265120725067 | -0.533 | 0.255 | 0.109 |
| 4.313406713378657 | -0.533 | 0.254 | 0.111 |
| 4.316548306032247 | -0.533 | 0.254 | 0.114 |
| 4.319689898685836 | -0.533 | 0.253 | 0.116 |
| 4.322831491339426 | -0.533 | 0.253 | 0.118 |
| 4.325973083993015 | -0.533 | 0.252 | 0.12 |
| 4.329114676646605 | -0.533 | 0.252 | 0.122 |
| 4.332256269300195 | -0.533 | 0.251 | 0.124 |
| 4.335397861953784 | -0.533 | 0.25 | 0.126 |
| 4.338539454607374 | -0.533 | 0.25 | 0.128 |
| 4.341681047260963 | -0.533 | 0.249 | 0.129 |
| 4.344822639914553 | -0.533 | 0.248 | 0.131 |
| 4.347964232568143 | -0.533 | 0.248 | 0.133 |
| 4.351105825221732 | -0.533 | 0.247 | 0.135 |
| 4.354247417875322 | -0.533 | 0.246 | 0.136 |
| 4.357389010528911 | -0.533 | 0.245 | 0.138 |
| 4.360530603182501 | -0.533 | 0.245 | 0.14 |
| 4.36367219583609 | -0.533 | 0.244 | 0.141 |
| 4.36681378848968 | -0.533 | 0.243 | 0.143 |
| 4.36995538114327 | -0.533 | 0.242 | 0.144 |
| 4.373096973796859 | -0.533 | 0.241 | 0.146 |
| 4.376238566450449 | -0.533 | 0.24 | 0.147 |
| 4.379380159104038 | -0.533 | 0.239 | 0.148 |
| 4.382521751757628 | -0.533 | 0.238 | 0.15 |
| 4.385663344411217 | -0.533 | 0.237 | 0.151 |
| 4.388804937064807 | -0.533 | 0.236 | 0.152 |
| 4.391946529718397 | -0.533 | 0.235 | 0.153 |
| 4.395088122371987 | -0.533 | 0.234 | 0.154 |
| 4.398229715025576 | -0.533 | 0.233 | 0.155 |
| 4.401371307679165 | -0.533 | 0.232 | 0.157 |
| 4.404512900332755 | -0.533 | 0.231 | 0.158 |
| 4.407654492986345 | -0.533 | 0.23 | 0.159 |
| 4.410796085639934 | -0.533 | 0.229 | 0.16 |
| 4.413937678293524 | -0.533 | 0.227 | 0.16 |
| 4.417079270947114 | -0.533 | 0.226 | 0.161 |
| 4.420220863600703 | -0.533 | 0.225 | 0.162 |
| 4.423362456254293 | -0.533 | 0.224 | 0.163 |
| 4.426504048907883 | -0.533 | 0.222 | 0.164 |
| 4.429645641561472 | -0.533 | 0.221 | 0.165 |
| 4.432787234215062 | -0.533 | 0.22 | 0.165 |
| 4.435928826868651 | -0.533 | 0.218 | 0.166 |
| 4.43907041952224 | -0.533 | 0.217 | 0.167 |
| 4.44221201217583 | -0.533 | 0.215 | 0.167 |
| 4.44535360482942 | -0.533 | 0.214 | 0.168 |
| 4.44849519748301 | -0.533 | 0.212 | 0.169 |
| 4.4516367901366 | -0.533 | 0.211 | 0.169 |
| 4.454778382790188 | -0.533 | 0.209 | 0.17 |
| 4.457919975443779 | -0.533 | 0.208 | 0.17 |
| 4.461061568097368 | -0.533 | 0.206 | 0.171 |
| 4.464203160750958 | -0.533 | 0.205 | 0.171 |
| 4.467344753404547 | -0.533 | 0.203 | 0.172 |
| 4.470486346058137 | -0.533 | 0.201 | 0.172 |
| 4.473627938711726 | -0.533 | 0.199 | 0.172 |
| 4.476769531365316 | -0.533 | 0.198 | 0.173 |
| 4.479911124018905 | -0.533 | 0.196 | 0.173 |
| 4.483052716672495 | -0.533 | 0.194 | 0.173 |
| 4.486194309326085 | -0.533 | 0.192 | 0.174 |
| 4.489335901979674 | -0.533 | 0.19 | 0.174 |
| 4.492477494633264 | -0.533 | 0.189 | 0.174 |
| 4.495619087286854 | -0.533 | 0.187 | 0.175 |
| 4.498760679940443 | -0.533 | 0.185 | 0.175 |
| 4.501902272594033 | -0.533 | 0.183 | 0.175 |
| 4.505043865247622 | -0.533 | 0.181 | 0.175 |
| 4.508185457901212 | -0.533 | 0.179 | 0.175 |
| 4.511327050554801 | -0.533 | 0.177 | 0.176 |
| 4.514468643208391 | -0.533 | 0.175 | 0.176 |
| 4.517610235861981 | -0.533 | 0.172 | 0.176 |
| 4.520751828515571 | -0.533 | 0.17 | 0.176 |
| 4.52389342116916 | -0.533 | 0.168 | 0.176 |
| 4.52703501382275 | -0.533 | 0.166 | 0.176 |
| 4.530176606476339 | -0.533 | 0.164 | 0.177 |
| 4.533318199129928 | -0.533 | 0.161 | 0.177 |
| 4.536459791783518 | -0.533 | 0.159 | 0.177 |
| 4.539601384437108 | -0.533 | 0.157 | 0.177 |
| 4.542742977090698 | -0.533 | 0.155 | 0.177 |
| 4.545884569744287 | -0.533 | 0.152 | 0.177 |
| 4.549026162397876 | -0.533 | 0.15 | 0.177 |
| 4.552167755051466 | -0.533 | 0.147 | 0.177 |
| 4.555309347705056 | -0.533 | 0.145 | 0.177 |
| 4.558450940358646 | -0.533 | 0.142 | 0.177 |
| 4.561592533012235 | -0.533 | 0.14 | 0.177 |
| 4.564734125665825 | -0.533 | 0.138 | 0.177 |
| 4.567875718319415 | -0.533 | 0.135 | 0.177 |
| 4.571017310973004 | -0.533 | 0.132 | 0.177 |
| 4.574158903626594 | -0.533 | 0.13 | 0.178 |
| 4.577300496280183 | -0.533 | 0.127 | 0.178 |
| 4.580442088933772 | -0.533 | 0.125 | 0.178 |
| 4.583583681587362 | -0.533 | 0.122 | 0.178 |
| 4.586725274240952 | -0.533 | 0.119 | 0.178 |
| 4.589866866894542 | -0.533 | 0.117 | 0.178 |
| 4.593008459548131 | -0.533 | 0.114 | 0.178 |
| 4.596150052201721 | -0.533 | 0.111 | 0.178 |
| 4.59929164485531 | -0.533 | 0.108 | 0.178 |
| 4.6024332375089 | -0.533 | 0.106 | 0.178 |
| 4.60557483016249 | -0.533 | 0.103 | 0.178 |
| 4.608716422816079 | -0.533 | 0.1 | 0.178 |
| 4.611858015469668 | -0.533 | 0.097 | 0.178 |
| 4.614999608123258 | -0.533 | 0.094 | 0.178 |
| 4.618141200776848 | -0.533 | 0.092 | 0.178 |
| 4.621282793430437 | -0.533 | 0.089 | 0.178 |
| 4.624424386084027 | -0.533 | 0.086 | 0.178 |
| 4.627565978737617 | -0.533 | 0.083 | 0.178 |
| 4.630707571391206 | -0.533 | 0.08 | 0.178 |
| 4.633849164044795 | -0.533 | 0.077 | 0.178 |
| 4.636990756698386 | -0.533 | 0.074 | 0.178 |
| 4.640132349351975 | -0.533 | 0.071 | 0.178 |
| 4.643273942005564 | -0.533 | 0.068 | 0.178 |
| 4.646415534659154 | -0.533 | 0.065 | 0.178 |
| 4.649557127312744 | -0.533 | 0.062 | 0.178 |
| 4.652698719966334 | -0.533 | 0.059 | 0.178 |
| 4.655840312619923 | -0.533 | 0.056 | 0.178 |
| 4.658981905273513 | -0.533 | 0.053 | 0.178 |
| 4.662123497927102 | -0.533 | 0.05 | 0.178 |
| 4.665265090580692 | -0.533 | 0.047 | 0.178 |
| 4.668406683234282 | -0.533 | 0.044 | 0.178 |
| 4.671548275887871 | -0.533 | 0.041 | 0.178 |
| 4.674689868541461 | -0.533 | 0.038 | 0.178 |
| 4.67783146119505 | -0.533 | 0.034 | 0.178 |
| 4.68097305384864 | -0.533 | 0.031 | 0.178 |
| 4.68411464650223 | -0.533 | 0.028 | 0.178 |
| 4.687256239155819 | -0.533 | 0.025 | 0.178 |
| 4.690397831809409 | -0.533 | 0.022 | 0.178 |
| 4.693539424462998 | -0.533 | 0.019 | 0.178 |
| 4.696681017116588 | -0.533 | 0.016 | 0.178 |
| 4.699822609770177 | -0.533 | 0.013 | 0.178 |
| 4.702964202423767 | -0.533 | 0.009 | 0.178 |
| 4.706105795077356 | -0.533 | 0.006 | 0.178 |
| 4.709247387730946 | -0.533 | 0.003 | 0.178 |
| 4.712388980384535 | -0.533 | 0 | 0.178 |
| 4.715530573038126 | -0.533 | -0.003 | 0.178 |
| 4.718672165691715 | -0.533 | -0.006 | 0.178 |
| 4.721813758345305 | -0.533 | -0.009 | 0.178 |
| 4.724955350998894 | -0.533 | -0.013 | 0.178 |
| 4.728096943652484 | -0.533 | -0.016 | 0.178 |
| 4.731238536306074 | -0.533 | -0.019 | 0.178 |
| 4.734380128959663 | -0.533 | -0.022 | 0.178 |
| 4.737521721613253 | -0.533 | -0.025 | 0.178 |
| 4.740663314266842 | -0.533 | -0.028 | 0.178 |
| 4.743804906920432 | -0.533 | -0.031 | 0.178 |
| 4.74694649957402 | -0.533 | -0.034 | 0.178 |
| 4.750088092227611 | -0.533 | -0.038 | 0.178 |
| 4.7532296848812 | -0.533 | -0.041 | 0.178 |
| 4.75637127753479 | -0.533 | -0.044 | 0.178 |
| 4.75951287018838 | -0.533 | -0.047 | 0.178 |
| 4.76265446284197 | -0.533 | -0.05 | 0.178 |
| 4.765796055495559 | -0.533 | -0.053 | 0.178 |
| 4.768937648149149 | -0.533 | -0.056 | 0.178 |
| 4.772079240802738 | -0.533 | -0.059 | 0.178 |
| 4.775220833456327 | -0.533 | -0.062 | 0.178 |
| 4.778362426109917 | -0.533 | -0.065 | 0.178 |
| 4.781504018763507 | -0.533 | -0.068 | 0.178 |
| 4.784645611417097 | -0.533 | -0.071 | 0.178 |
| 4.787787204070686 | -0.533 | -0.074 | 0.178 |
| 4.790928796724275 | -0.533 | -0.077 | 0.178 |
| 4.794070389377865 | -0.533 | -0.08 | 0.178 |
| 4.797211982031455 | -0.533 | -0.083 | 0.178 |
| 4.800353574685045 | -0.533 | -0.086 | 0.178 |
| 4.803495167338634 | -0.533 | -0.089 | 0.178 |
| 4.806636759992224 | -0.533 | -0.092 | 0.178 |
| 4.809778352645814 | -0.533 | -0.094 | 0.178 |
| 4.812919945299403 | -0.533 | -0.097 | 0.178 |
| 4.816061537952993 | -0.533 | -0.1 | 0.178 |
| 4.819203130606582 | -0.533 | -0.103 | 0.178 |
| 4.822344723260172 | -0.533 | -0.106 | 0.178 |
| 4.825486315913761 | -0.533 | -0.108 | 0.178 |
| 4.828627908567351 | -0.533 | -0.111 | 0.178 |
| 4.83176950122094 | -0.533 | -0.114 | 0.178 |
| 4.83491109387453 | -0.533 | -0.117 | 0.178 |
| 4.83805268652812 | -0.533 | -0.119 | 0.178 |
| 4.841194279181709 | -0.533 | -0.122 | 0.178 |
| 4.844335871835299 | -0.533 | -0.125 | 0.178 |
| 4.847477464488889 | -0.533 | -0.127 | 0.178 |
| 4.850619057142478 | -0.533 | -0.13 | 0.178 |
| 4.853760649796068 | -0.533 | -0.132 | 0.177 |
| 4.856902242449657 | -0.533 | -0.135 | 0.177 |
| 4.860043835103247 | -0.533 | -0.138 | 0.177 |
| 4.863185427756837 | -0.533 | -0.14 | 0.177 |
| 4.866327020410426 | -0.533 | -0.142 | 0.177 |
| 4.869468613064015 | -0.533 | -0.145 | 0.177 |
| 4.872610205717605 | -0.533 | -0.147 | 0.177 |
| 4.875751798371195 | -0.533 | -0.15 | 0.177 |
| 4.878893391024784 | -0.533 | -0.152 | 0.177 |
| 4.882034983678374 | -0.533 | -0.155 | 0.177 |
| 4.885176576331964 | -0.533 | -0.157 | 0.177 |
| 4.888318168985553 | -0.533 | -0.159 | 0.177 |
| 4.891459761639143 | -0.533 | -0.161 | 0.177 |
| 4.894601354292733 | -0.533 | -0.164 | 0.177 |
| 4.897742946946322 | -0.533 | -0.166 | 0.176 |
| 4.900884539599912 | -0.533 | -0.168 | 0.176 |
| 4.904026132253501 | -0.533 | -0.17 | 0.176 |
| 4.907167724907091 | -0.533 | -0.172 | 0.176 |
| 4.91030931756068 | -0.533 | -0.175 | 0.176 |
| 4.91345091021427 | -0.533 | -0.177 | 0.176 |
| 4.91659250286786 | -0.533 | -0.179 | 0.175 |
| 4.91973409552145 | -0.533 | -0.181 | 0.175 |
| 4.922875688175039 | -0.533 | -0.183 | 0.175 |
| 4.926017280828628 | -0.533 | -0.185 | 0.175 |
| 4.929158873482218 | -0.533 | -0.187 | 0.175 |
| 4.932300466135808 | -0.533 | -0.189 | 0.174 |
| 4.935442058789397 | -0.533 | -0.19 | 0.174 |
| 4.938583651442987 | -0.533 | -0.192 | 0.174 |
| 4.941725244096576 | -0.533 | -0.194 | 0.173 |
| 4.944866836750166 | -0.533 | -0.196 | 0.173 |
| 4.948008429403755 | -0.533 | -0.198 | 0.173 |
| 4.951150022057345 | -0.533 | -0.199 | 0.172 |
| 4.954291614710935 | -0.533 | -0.201 | 0.172 |
| 4.957433207364524 | -0.533 | -0.203 | 0.172 |
| 4.960574800018114 | -0.533 | -0.205 | 0.171 |
| 4.963716392671704 | -0.533 | -0.206 | 0.171 |
| 4.966857985325293 | -0.533 | -0.208 | 0.17 |
| 4.969999577978883 | -0.533 | -0.209 | 0.17 |
| 4.973141170632472 | -0.533 | -0.211 | 0.169 |
| 4.976282763286062 | -0.533 | -0.212 | 0.169 |
| 4.979424355939651 | -0.533 | -0.214 | 0.168 |
| 4.982565948593241 | -0.533 | -0.215 | 0.167 |
| 4.985707541246831 | -0.533 | -0.217 | 0.167 |
| 4.98884913390042 | -0.533 | -0.218 | 0.166 |
| 4.99199072655401 | -0.533 | -0.22 | 0.165 |
| 4.9951323192076 | -0.533 | -0.221 | 0.165 |
| 4.99827391186119 | -0.533 | -0.222 | 0.164 |
| 5.00141550451478 | -0.533 | -0.224 | 0.163 |
| 5.004557097168369 | -0.533 | -0.225 | 0.162 |
| 5.007698689821958 | -0.533 | -0.226 | 0.161 |
| 5.010840282475548 | -0.533 | -0.227 | 0.16 |
| 5.013981875129137 | -0.533 | -0.229 | 0.16 |
| 5.017123467782727 | -0.533 | -0.23 | 0.159 |
| 5.020265060436317 | -0.533 | -0.231 | 0.158 |
| 5.023406653089906 | -0.533 | -0.232 | 0.157 |
| 5.026548245743496 | -0.533 | -0.233 | 0.155 |
| 5.029689838397085 | -0.533 | -0.234 | 0.154 |
| 5.032831431050674 | -0.533 | -0.235 | 0.153 |
| 5.035973023704264 | -0.533 | -0.236 | 0.152 |
| 5.039114616357854 | -0.533 | -0.237 | 0.151 |
| 5.042256209011444 | -0.533 | -0.238 | 0.15 |
| 5.045397801665033 | -0.533 | -0.239 | 0.148 |
| 5.048539394318622 | -0.533 | -0.24 | 0.147 |
| 5.051680986972213 | -0.533 | -0.241 | 0.146 |
| 5.054822579625802 | -0.533 | -0.242 | 0.144 |
| 5.057964172279392 | -0.533 | -0.243 | 0.143 |
| 5.061105764932981 | -0.533 | -0.244 | 0.141 |
| 5.064247357586571 | -0.533 | -0.245 | 0.14 |
| 5.067388950240161 | -0.533 | -0.245 | 0.138 |
| 5.07053054289375 | -0.533 | -0.246 | 0.136 |
| 5.07367213554734 | -0.533 | -0.247 | 0.135 |
| 5.07681372820093 | -0.533 | -0.248 | 0.133 |
| 5.079955320854519 | -0.533 | -0.248 | 0.131 |
| 5.083096913508108 | -0.533 | -0.249 | 0.129 |
| 5.086238506161698 | -0.533 | -0.25 | 0.128 |
| 5.089380098815288 | -0.533 | -0.25 | 0.126 |
| 5.092521691468877 | -0.533 | -0.251 | 0.124 |
| 5.095663284122466 | -0.533 | -0.252 | 0.122 |
| 5.098804876776057 | -0.533 | -0.252 | 0.12 |
| 5.101946469429646 | -0.533 | -0.253 | 0.118 |
| 5.105088062083236 | -0.533 | -0.253 | 0.116 |
| 5.108229654736825 | -0.533 | -0.254 | 0.114 |
| 5.111371247390415 | -0.533 | -0.254 | 0.111 |
| 5.114512840044005 | -0.533 | -0.255 | 0.109 |
| 5.117654432697594 | -0.533 | -0.255 | 0.107 |
| 5.120796025351184 | -0.533 | -0.256 | 0.105 |
| 5.123937618004773 | -0.533 | -0.256 | 0.102 |
| 5.127079210658363 | -0.533 | -0.257 | 0.1 |
| 5.130220803311953 | -0.533 | -0.257 | 0.097 |
| 5.133362395965542 | -0.533 | -0.258 | 0.095 |
| 5.136503988619131 | -0.532 | -0.258 | 0.093 |
| 5.13964558127272 | -0.532 | -0.259 | 0.09 |
| 5.142787173926311 | -0.532 | -0.259 | 0.087 |
| 5.1459287665799 | -0.532 | -0.259 | 0.085 |
| 5.14907035923349 | -0.532 | -0.26 | 0.082 |
| 5.15221195188708 | -0.532 | -0.26 | 0.08 |
| 5.15535354454067 | -0.532 | -0.26 | 0.077 |
| 5.158495137194259 | -0.532 | -0.261 | 0.074 |
| 5.161636729847848 | -0.532 | -0.261 | 0.071 |
| 5.164778322501438 | -0.532 | -0.261 | 0.069 |
| 5.167919915155028 | -0.532 | -0.261 | 0.066 |
| 5.171061507808617 | -0.532 | -0.262 | 0.063 |
| 5.174203100462206 | -0.532 | -0.262 | 0.06 |
| 5.177344693115796 | -0.532 | -0.262 | 0.057 |
| 5.180486285769386 | -0.532 | -0.262 | 0.054 |
| 5.183627878422976 | -0.532 | -0.263 | 0.051 |
| 5.186769471076565 | -0.532 | -0.263 | 0.048 |
| 5.189911063730155 | -0.532 | -0.263 | 0.045 |
| 5.193052656383744 | -0.532 | -0.263 | 0.042 |
| 5.196194249037334 | -0.531 | -0.263 | 0.039 |
| 5.199335841690924 | -0.531 | -0.264 | 0.036 |
| 5.202477434344513 | -0.531 | -0.264 | 0.033 |
| 5.205619026998103 | -0.531 | -0.264 | 0.03 |
| 5.208760619651692 | -0.531 | -0.264 | 0.027 |
| 5.211902212305282 | -0.531 | -0.264 | 0.024 |
| 5.215043804958871 | -0.531 | -0.264 | 0.021 |
| 5.218185397612461 | -0.531 | -0.265 | 0.018 |
| 5.221326990266051 | -0.531 | -0.265 | 0.015 |
| 5.22446858291964 | -0.531 | -0.265 | 0.012 |
| 5.22761017557323 | -0.531 | -0.265 | 0.008 |
| 5.23075176822682 | -0.531 | -0.265 | 0.005 |
| 5.23389336088041 | -0.531 | -0.265 | 0.002 |
| 5.237034953533999 | -0.53 | -0.265 | -0.001 |
| 5.240176546187588 | -0.53 | -0.265 | -0.004 |
| 5.243318138841178 | -0.53 | -0.265 | -0.007 |
| 5.246459731494767 | -0.53 | -0.266 | -0.01 |
| 5.249601324148357 | -0.53 | -0.266 | -0.014 |
| 5.252742916801947 | -0.53 | -0.266 | -0.017 |
| 5.255884509455536 | -0.53 | -0.266 | -0.02 |
| 5.259026102109125 | -0.53 | -0.266 | -0.023 |
| 5.262167694762715 | -0.53 | -0.266 | -0.026 |
| 5.265309287416305 | -0.529 | -0.266 | -0.029 |
| 5.268450880069895 | -0.529 | -0.266 | -0.032 |
| 5.271592472723484 | -0.529 | -0.266 | -0.035 |
| 5.274734065377074 | -0.529 | -0.266 | -0.038 |
| 5.277875658030664 | -0.529 | -0.266 | -0.041 |
| 5.281017250684253 | -0.529 | -0.266 | -0.044 |
| 5.284158843337843 | -0.529 | -0.266 | -0.047 |
| 5.287300435991432 | -0.528 | -0.266 | -0.05 |
| 5.290442028645022 | -0.528 | -0.266 | -0.053 |
| 5.293583621298612 | -0.528 | -0.266 | -0.056 |
| 5.296725213952201 | -0.528 | -0.266 | -0.059 |
| 5.299866806605791 | -0.528 | -0.266 | -0.062 |
| 5.30300839925938 | -0.528 | -0.266 | -0.065 |
| 5.30614999191297 | -0.527 | -0.266 | -0.068 |
| 5.30929158456656 | -0.527 | -0.266 | -0.07 |
| 5.312433177220149 | -0.527 | -0.266 | -0.073 |
| 5.315574769873739 | -0.527 | -0.266 | -0.076 |
| 5.318716362527328 | -0.527 | -0.267 | -0.079 |
| 5.321857955180918 | -0.527 | -0.267 | -0.081 |
| 5.324999547834508 | -0.526 | -0.267 | -0.084 |
| 5.328141140488097 | -0.526 | -0.267 | -0.087 |
| 5.331282733141686 | -0.526 | -0.267 | -0.089 |
| 5.334424325795276 | -0.526 | -0.267 | -0.092 |
| 5.337565918448866 | -0.526 | -0.267 | -0.094 |
| 5.340707511102456 | -0.525 | -0.267 | -0.097 |
| 5.343849103756045 | -0.525 | -0.267 | -0.099 |
| 5.346990696409634 | -0.525 | -0.267 | -0.101 |
| 5.350132289063224 | -0.525 | -0.267 | -0.104 |
| 5.353273881716814 | -0.524 | -0.267 | -0.106 |
| 5.356415474370403 | -0.524 | -0.267 | -0.108 |
| 5.359557067023993 | -0.524 | -0.267 | -0.111 |
| 5.362698659677583 | -0.524 | -0.267 | -0.113 |
| 5.365840252331172 | -0.523 | -0.267 | -0.115 |
| 5.368981844984762 | -0.523 | -0.267 | -0.117 |
| 5.372123437638351 | -0.523 | -0.267 | -0.119 |
| 5.375265030291941 | -0.523 | -0.267 | -0.121 |
| 5.378406622945531 | -0.522 | -0.267 | -0.123 |
| 5.38154821559912 | -0.522 | -0.267 | -0.125 |
| 5.38468980825271 | -0.522 | -0.267 | -0.127 |
| 5.387831400906299 | -0.521 | -0.267 | -0.129 |
| 5.39097299355989 | -0.521 | -0.267 | -0.131 |
| 5.394114586213479 | -0.521 | -0.267 | -0.132 |
| 5.397256178867068 | -0.521 | -0.267 | -0.134 |
| 5.400397771520657 | -0.52 | -0.267 | -0.136 |
| 5.403539364174247 | -0.52 | -0.267 | -0.137 |
| 5.406680956827837 | -0.52 | -0.267 | -0.139 |
| 5.409822549481426 | -0.519 | -0.267 | -0.141 |
| 5.412964142135016 | -0.519 | -0.267 | -0.142 |
| 5.416105734788605 | -0.518 | -0.267 | -0.144 |
| 5.419247327442195 | -0.518 | -0.267 | -0.145 |
| 5.422388920095785 | -0.518 | -0.267 | -0.146 |
| 5.425530512749375 | -0.517 | -0.267 | -0.148 |
| 5.428672105402964 | -0.517 | -0.267 | -0.149 |
| 5.431813698056554 | -0.517 | -0.267 | -0.15 |
| 5.434955290710143 | -0.516 | -0.267 | -0.152 |
| 5.438096883363733 | -0.516 | -0.267 | -0.153 |
| 5.441238476017322 | -0.515 | -0.267 | -0.154 |
| 5.444380068670912 | -0.515 | -0.267 | -0.155 |
| 5.447521661324502 | -0.515 | -0.267 | -0.156 |
| 5.450663253978091 | -0.514 | -0.267 | -0.157 |
| 5.453804846631681 | -0.514 | -0.267 | -0.158 |
| 5.456946439285271 | -0.513 | -0.267 | -0.159 |
| 5.46008803193886 | -0.513 | -0.267 | -0.16 |
| 5.46322962459245 | -0.512 | -0.267 | -0.161 |
| 5.466371217246039 | -0.512 | -0.267 | -0.162 |
| 5.46951280989963 | -0.511 | -0.267 | -0.163 |
| 5.472654402553218 | -0.511 | -0.267 | -0.164 |
| 5.475795995206808 | -0.51 | -0.267 | -0.164 |
| 5.478937587860398 | -0.51 | -0.267 | -0.165 |
| 5.482079180513987 | -0.509 | -0.267 | -0.166 |
| 5.485220773167577 | -0.509 | -0.267 | -0.166 |
| 5.488362365821166 | -0.508 | -0.267 | -0.167 |
| 5.491503958474756 | -0.508 | -0.267 | -0.168 |
| 5.494645551128346 | -0.507 | -0.267 | -0.168 |
| 5.497787143781935 | -0.507 | -0.267 | -0.169 |
| 5.500928736435525 | -0.506 | -0.267 | -0.169 |
| 5.504070329089115 | -0.506 | -0.267 | -0.17 |
| 5.507211921742704 | -0.505 | -0.267 | -0.17 |
| 5.510353514396294 | -0.504 | -0.267 | -0.171 |
| 5.513495107049883 | -0.504 | -0.267 | -0.171 |
| 5.516636699703473 | -0.503 | -0.267 | -0.172 |
| 5.519778292357062 | -0.503 | -0.267 | -0.172 |
| 5.522919885010652 | -0.502 | -0.267 | -0.173 |
| 5.526061477664242 | -0.501 | -0.267 | -0.173 |
| 5.529203070317831 | -0.501 | -0.267 | -0.173 |
| 5.532344662971421 | -0.5 | -0.267 | -0.174 |
| 5.535486255625011 | -0.499 | -0.267 | -0.174 |
| 5.5386278482786 | -0.499 | -0.267 | -0.174 |
| 5.54176944093219 | -0.498 | -0.267 | -0.174 |
| 5.544911033585779 | -0.497 | -0.267 | -0.175 |
| 5.54805262623937 | -0.497 | -0.267 | -0.175 |
| 5.551194218892959 | -0.496 | -0.267 | -0.175 |
| 5.554335811546548 | -0.495 | -0.267 | -0.175 |
| 5.557477404200137 | -0.495 | -0.267 | -0.176 |
| 5.560618996853727 | -0.494 | -0.267 | -0.176 |
| 5.563760589507317 | -0.493 | -0.267 | -0.176 |
| 5.566902182160906 | -0.492 | -0.267 | -0.176 |
| 5.570043774814496 | -0.492 | -0.267 | -0.176 |
| 5.573185367468086 | -0.491 | -0.267 | -0.176 |
| 5.576326960121675 | -0.49 | -0.267 | -0.177 |
| 5.579468552775264 | -0.489 | -0.267 | -0.177 |
| 5.582610145428854 | -0.488 | -0.267 | -0.177 |
| 5.585751738082444 | -0.487 | -0.267 | -0.177 |
| 5.588893330736034 | -0.487 | -0.267 | -0.177 |
| 5.592034923389623 | -0.486 | -0.267 | -0.177 |
| 5.595176516043213 | -0.485 | -0.267 | -0.177 |
| 5.598318108696803 | -0.484 | -0.267 | -0.177 |
| 5.601459701350392 | -0.483 | -0.267 | -0.177 |
| 5.604601294003982 | -0.482 | -0.267 | -0.177 |
| 5.607742886657571 | -0.481 | -0.267 | -0.177 |
| 5.610884479311161 | -0.48 | -0.267 | -0.177 |
| 5.61402607196475 | -0.48 | -0.267 | -0.177 |
| 5.61716766461834 | -0.479 | -0.267 | -0.177 |
| 5.62030925727193 | -0.478 | -0.267 | -0.178 |
| 5.623450849925519 | -0.477 | -0.267 | -0.178 |
| 5.626592442579109 | -0.476 | -0.267 | -0.178 |
| 5.629734035232698 | -0.475 | -0.267 | -0.178 |
| 5.632875627886288 | -0.474 | -0.267 | -0.178 |
| 5.636017220539878 | -0.473 | -0.267 | -0.178 |
| 5.639158813193467 | -0.472 | -0.267 | -0.178 |
| 5.642300405847057 | -0.471 | -0.267 | -0.178 |
| 5.645441998500646 | -0.47 | -0.267 | -0.178 |
| 5.648583591154236 | -0.469 | -0.267 | -0.178 |
| 5.651725183807825 | -0.468 | -0.267 | -0.178 |
| 5.654866776461415 | -0.466 | -0.267 | -0.178 |
| 5.658008369115005 | -0.465 | -0.267 | -0.178 |
| 5.661149961768594 | -0.464 | -0.267 | -0.178 |
| 5.664291554422184 | -0.463 | -0.267 | -0.178 |
| 5.667433147075774 | -0.462 | -0.267 | -0.178 |
| 5.670574739729363 | -0.461 | -0.267 | -0.178 |
| 5.673716332382953 | -0.46 | -0.267 | -0.178 |
| 5.676857925036542 | -0.459 | -0.267 | -0.178 |
| 5.679999517690132 | -0.457 | -0.266 | -0.178 |
| 5.683141110343721 | -0.456 | -0.266 | -0.178 |
| 5.686282702997311 | -0.455 | -0.266 | -0.178 |
| 5.689424295650901 | -0.454 | -0.266 | -0.178 |
| 5.69256588830449 | -0.452 | -0.266 | -0.178 |
| 5.69570748095808 | -0.451 | -0.266 | -0.178 |
| 5.69884907361167 | -0.45 | -0.266 | -0.178 |
| 5.701990666265259 | -0.449 | -0.266 | -0.178 |
| 5.705132258918849 | -0.447 | -0.266 | -0.178 |
| 5.708273851572438 | -0.446 | -0.266 | -0.178 |
| 5.711415444226028 | -0.445 | -0.266 | -0.178 |
| 5.714557036879618 | -0.443 | -0.266 | -0.178 |
| 5.717698629533207 | -0.442 | -0.266 | -0.178 |
| 5.720840222186797 | -0.441 | -0.266 | -0.178 |
| 5.723981814840386 | -0.439 | -0.266 | -0.178 |
| 5.727123407493976 | -0.438 | -0.266 | -0.178 |
| 5.730265000147565 | -0.437 | -0.266 | -0.178 |
| 5.733406592801155 | -0.435 | -0.266 | -0.178 |
| 5.736548185454744 | -0.434 | -0.266 | -0.178 |
| 5.739689778108334 | -0.432 | -0.266 | -0.178 |
| 5.742831370761924 | -0.431 | -0.266 | -0.178 |
| 5.745972963415514 | -0.429 | -0.266 | -0.178 |
| 5.749114556069103 | -0.428 | -0.266 | -0.178 |
| 5.752256148722693 | -0.426 | -0.265 | -0.178 |
| 5.755397741376282 | -0.425 | -0.265 | -0.178 |
| 5.758539334029872 | -0.423 | -0.265 | -0.178 |
| 5.761680926683462 | -0.422 | -0.265 | -0.178 |
| 5.764822519337051 | -0.42 | -0.265 | -0.178 |
| 5.767964111990641 | -0.419 | -0.265 | -0.178 |
| 5.77110570464423 | -0.417 | -0.265 | -0.178 |
| 5.77424729729782 | -0.416 | -0.265 | -0.178 |
| 5.77738888995141 | -0.414 | -0.265 | -0.178 |
| 5.780530482605 | -0.412 | -0.264 | -0.178 |
| 5.783672075258588 | -0.411 | -0.264 | -0.178 |
| 5.786813667912178 | -0.409 | -0.264 | -0.178 |
| 5.789955260565768 | -0.407 | -0.264 | -0.178 |
| 5.793096853219358 | -0.406 | -0.264 | -0.178 |
| 5.796238445872947 | -0.404 | -0.264 | -0.178 |
| 5.799380038526537 | -0.402 | -0.263 | -0.178 |
| 5.802521631180126 | -0.401 | -0.263 | -0.178 |
| 5.805663223833715 | -0.399 | -0.263 | -0.178 |
| 5.808804816487306 | -0.397 | -0.263 | -0.178 |
| 5.811946409140895 | -0.395 | -0.263 | -0.178 |
| 5.815088001794485 | -0.394 | -0.262 | -0.178 |
| 5.818229594448074 | -0.392 | -0.262 | -0.178 |
| 5.821371187101663 | -0.39 | -0.262 | -0.178 |
| 5.824512779755254 | -0.388 | -0.262 | -0.178 |
| 5.827654372408843 | -0.386 | -0.261 | -0.178 |
| 5.830795965062433 | -0.385 | -0.261 | -0.178 |
| 5.833937557716022 | -0.383 | -0.261 | -0.178 |
| 5.837079150369612 | -0.381 | -0.261 | -0.178 |
| 5.840220743023201 | -0.379 | -0.26 | -0.178 |
| 5.843362335676791 | -0.377 | -0.26 | -0.178 |
| 5.846503928330381 | -0.375 | -0.26 | -0.178 |
| 5.84964552098397 | -0.373 | -0.259 | -0.178 |
| 5.85278711363756 | -0.371 | -0.259 | -0.178 |
| 5.85592870629115 | -0.369 | -0.259 | -0.178 |
| 5.85907029894474 | -0.367 | -0.258 | -0.178 |
| 5.862211891598329 | -0.365 | -0.258 | -0.178 |
| 5.865353484251918 | -0.363 | -0.257 | -0.178 |
| 5.868495076905508 | -0.361 | -0.257 | -0.178 |
| 5.871636669559098 | -0.359 | -0.256 | -0.178 |
| 5.874778262212687 | -0.357 | -0.256 | -0.178 |
| 5.877919854866277 | -0.355 | -0.255 | -0.178 |
| 5.881061447519866 | -0.353 | -0.255 | -0.178 |
| 5.884203040173456 | -0.351 | -0.254 | -0.178 |
| 5.887344632827046 | -0.349 | -0.254 | -0.178 |
| 5.890486225480635 | -0.347 | -0.253 | -0.178 |
| 5.893627818134224 | -0.345 | -0.253 | -0.178 |
| 5.896769410787814 | -0.343 | -0.252 | -0.178 |
| 5.899911003441404 | -0.341 | -0.252 | -0.178 |
| 5.903052596094994 | -0.338 | -0.251 | -0.177 |
| 5.906194188748583 | -0.336 | -0.25 | -0.177 |
| 5.909335781402172 | -0.334 | -0.25 | -0.177 |
| 5.912477374055762 | -0.332 | -0.249 | -0.177 |
| 5.915618966709352 | -0.33 | -0.248 | -0.177 |
| 5.918760559362942 | -0.327 | -0.248 | -0.177 |
| 5.921902152016531 | -0.325 | -0.247 | -0.177 |
| 5.92504374467012 | -0.323 | -0.246 | -0.177 |
| 5.92818533732371 | -0.321 | -0.245 | -0.177 |
| 5.9313269299773 | -0.318 | -0.245 | -0.177 |
| 5.93446852263089 | -0.316 | -0.244 | -0.177 |
| 5.93761011528448 | -0.314 | -0.243 | -0.177 |
| 5.940751707938068 | -0.311 | -0.242 | -0.177 |
| 5.943893300591658 | -0.309 | -0.241 | -0.176 |
| 5.947034893245248 | -0.307 | -0.24 | -0.176 |
| 5.950176485898837 | -0.304 | -0.239 | -0.176 |
| 5.953318078552427 | -0.302 | -0.238 | -0.176 |
| 5.956459671206017 | -0.3 | -0.237 | -0.176 |
| 5.959601263859606 | -0.297 | -0.236 | -0.176 |
| 5.962742856513196 | -0.295 | -0.235 | -0.176 |
| 5.965884449166785 | -0.292 | -0.234 | -0.175 |
| 5.969026041820375 | -0.29 | -0.233 | -0.175 |
| 5.972167634473964 | -0.287 | -0.232 | -0.175 |
| 5.975309227127554 | -0.285 | -0.231 | -0.175 |
| 5.978450819781144 | -0.283 | -0.23 | -0.174 |
| 5.981592412434733 | -0.28 | -0.229 | -0.174 |
| 5.984734005088323 | -0.278 | -0.227 | -0.174 |
| 5.987875597741913 | -0.275 | -0.226 | -0.174 |
| 5.991017190395502 | -0.272 | -0.225 | -0.173 |
| 5.994158783049092 | -0.27 | -0.224 | -0.173 |
| 5.997300375702681 | -0.267 | -0.222 | -0.172 |
| 6.000441968356271 | -0.265 | -0.221 | -0.172 |
| 6.003583561009861 | -0.262 | -0.22 | -0.172 |
| 6.00672515366345 | -0.26 | -0.218 | -0.171 |
| 6.00986674631704 | -0.257 | -0.217 | -0.171 |
| 6.01300833897063 | -0.254 | -0.215 | -0.17 |
| 6.01614993162422 | -0.252 | -0.214 | -0.17 |
| 6.019291524277808 | -0.249 | -0.212 | -0.169 |
| 6.022433116931398 | -0.247 | -0.211 | -0.169 |
| 6.025574709584988 | -0.244 | -0.209 | -0.168 |
| 6.028716302238577 | -0.241 | -0.208 | -0.168 |
| 6.031857894892167 | -0.239 | -0.206 | -0.167 |
| 6.034999487545757 | -0.236 | -0.205 | -0.166 |
| 6.038141080199346 | -0.233 | -0.203 | -0.166 |
| 6.041282672852935 | -0.231 | -0.201 | -0.165 |
| 6.044424265506525 | -0.228 | -0.199 | -0.164 |
| 6.047565858160115 | -0.225 | -0.198 | -0.163 |
| 6.050707450813704 | -0.222 | -0.196 | -0.162 |
| 6.053849043467294 | -0.22 | -0.194 | -0.162 |
| 6.056990636120884 | -0.217 | -0.192 | -0.161 |
| 6.060132228774473 | -0.214 | -0.19 | -0.16 |
| 6.063273821428063 | -0.211 | -0.189 | -0.159 |
| 6.066415414081653 | -0.209 | -0.187 | -0.158 |
| 6.069557006735242 | -0.206 | -0.185 | -0.157 |
| 6.072698599388831 | -0.203 | -0.183 | -0.156 |
| 6.07584019204242 | -0.2 | -0.181 | -0.155 |
| 6.078981784696011 | -0.197 | -0.179 | -0.154 |
| 6.082123377349601 | -0.194 | -0.177 | -0.152 |
| 6.08526497000319 | -0.192 | -0.175 | -0.151 |
| 6.08840656265678 | -0.189 | -0.172 | -0.15 |
| 6.09154815531037 | -0.186 | -0.17 | -0.149 |
| 6.094689747963959 | -0.183 | -0.168 | -0.147 |
| 6.097831340617549 | -0.18 | -0.166 | -0.146 |
| 6.100972933271138 | -0.177 | -0.164 | -0.145 |
| 6.104114525924728 | -0.174 | -0.161 | -0.143 |
| 6.107256118578317 | -0.171 | -0.159 | -0.142 |
| 6.110397711231907 | -0.169 | -0.157 | -0.14 |
| 6.113539303885497 | -0.166 | -0.155 | -0.139 |
| 6.116680896539086 | -0.163 | -0.152 | -0.137 |
| 6.119822489192675 | -0.16 | -0.15 | -0.135 |
| 6.122964081846265 | -0.157 | -0.147 | -0.134 |
| 6.126105674499855 | -0.154 | -0.145 | -0.132 |
| 6.129247267153445 | -0.151 | -0.142 | -0.13 |
| 6.132388859807034 | -0.148 | -0.14 | -0.128 |
| 6.135530452460624 | -0.145 | -0.138 | -0.126 |
| 6.138672045114213 | -0.142 | -0.135 | -0.124 |
| 6.141813637767803 | -0.139 | -0.132 | -0.122 |
| 6.144955230421393 | -0.136 | -0.13 | -0.12 |
| 6.148096823074982 | -0.133 | -0.127 | -0.118 |
| 6.151238415728571 | -0.13 | -0.125 | -0.116 |
| 6.154380008382161 | -0.127 | -0.122 | -0.114 |
| 6.157521601035751 | -0.124 | -0.119 | -0.112 |
| 6.16066319368934 | -0.121 | -0.117 | -0.11 |
| 6.16380478634293 | -0.118 | -0.114 | -0.108 |
| 6.16694637899652 | -0.115 | -0.111 | -0.105 |
| 6.170087971650109 | -0.112 | -0.108 | -0.103 |
| 6.173229564303698 | -0.109 | -0.106 | -0.101 |
| 6.176371156957289 | -0.106 | -0.103 | -0.098 |
| 6.179512749610878 | -0.103 | -0.1 | -0.096 |
| 6.182654342264468 | -0.1 | -0.097 | -0.093 |
| 6.185795934918057 | -0.097 | -0.094 | -0.091 |
| 6.188937527571647 | -0.094 | -0.092 | -0.088 |
| 6.192079120225237 | -0.09 | -0.089 | -0.086 |
| 6.195220712878826 | -0.087 | -0.086 | -0.083 |
| 6.198362305532415 | -0.084 | -0.083 | -0.08 |
| 6.201503898186005 | -0.081 | -0.08 | -0.078 |
| 6.204645490839594 | -0.078 | -0.077 | -0.075 |
| 6.207787083493184 | -0.075 | -0.074 | -0.072 |
| 6.210928676146774 | -0.072 | -0.071 | -0.07 |
| 6.214070268800364 | -0.069 | -0.068 | -0.067 |
| 6.217211861453953 | -0.066 | -0.065 | -0.064 |
| 6.220353454107543 | -0.063 | -0.062 | -0.061 |
| 6.223495046761133 | -0.06 | -0.059 | -0.058 |
| 6.226636639414722 | -0.056 | -0.056 | -0.055 |
| 6.229778232068312 | -0.053 | -0.053 | -0.052 |
| 6.232919824721901 | -0.05 | -0.05 | -0.049 |
| 6.236061417375491 | -0.047 | -0.047 | -0.046 |
| 6.23920301002908 | -0.044 | -0.044 | -0.043 |
| 6.24234460268267 | -0.041 | -0.041 | -0.04 |
| 6.24548619533626 | -0.038 | -0.038 | -0.037 |
| 6.24862778798985 | -0.035 | -0.034 | -0.034 |
| 6.251769380643438 | -0.031 | -0.031 | -0.031 |
| 6.254910973297028 | -0.028 | -0.028 | -0.028 |
| 6.258052565950618 | -0.025 | -0.025 | -0.025 |
| 6.261194158604208 | -0.022 | -0.022 | -0.022 |
| 6.264335751257797 | -0.019 | -0.019 | -0.019 |
| 6.267477343911387 | -0.016 | -0.016 | -0.016 |
| 6.270618936564976 | -0.013 | -0.013 | -0.013 |
| 6.273760529218566 | -0.009 | -0.009 | -0.009 |
| 6.276902121872155 | -0.006 | -0.006 | -0.006 |
| 6.280043714525745 | -0.003 | -0.003 | -0.003 |
| 6.283185307179335 | 0 | 0 | 0 |